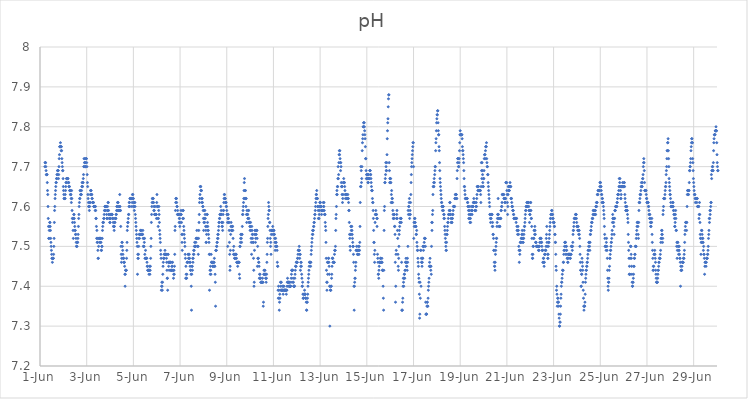
| Category | pH |
|---|---|
| 44348.208333333336 | 7.7 |
| 44348.21875 | 7.71 |
| 44348.229166666664 | 7.71 |
| 44348.239583333336 | 7.71 |
| 44348.25 | 7.7 |
| 44348.260416666664 | 7.69 |
| 44348.270833333336 | 7.68 |
| 44348.28125 | 7.68 |
| 44348.291666666664 | 7.68 |
| 44348.302083333336 | 7.68 |
| 44348.3125 | 7.66 |
| 44348.322916666664 | 7.64 |
| 44348.333333333336 | 7.63 |
| 44348.34375 | 7.6 |
| 44348.354166666664 | 7.57 |
| 44348.364583333336 | 7.55 |
| 44348.375 | 7.52 |
| 44348.385416666664 | 7.52 |
| 44348.395833333336 | 7.54 |
| 44348.40625 | 7.55 |
| 44348.416666666664 | 7.56 |
| 44348.427083333336 | 7.56 |
| 44348.4375 | 7.55 |
| 44348.447916666664 | 7.54 |
| 44348.458333333336 | 7.52 |
| 44348.46875 | 7.51 |
| 44348.479166666664 | 7.5 |
| 44348.489583333336 | 7.49 |
| 44348.5 | 7.48 |
| 44348.510416666664 | 7.47 |
| 44348.520833333336 | 7.47 |
| 44348.53125 | 7.46 |
| 44348.541666666664 | 7.47 |
| 44348.552083333336 | 7.47 |
| 44348.5625 | 7.47 |
| 44348.572916666664 | 7.47 |
| 44348.583333333336 | 7.48 |
| 44348.59375 | 7.5 |
| 44348.604166666664 | 7.52 |
| 44348.614583333336 | 7.56 |
| 44348.625 | 7.59 |
| 44348.635416666664 | 7.6 |
| 44348.645833333336 | 7.62 |
| 44348.65625 | 7.63 |
| 44348.666666666664 | 7.64 |
| 44348.677083333336 | 7.65 |
| 44348.6875 | 7.66 |
| 44348.697916666664 | 7.66 |
| 44348.708333333336 | 7.67 |
| 44348.71875 | 7.67 |
| 44348.729166666664 | 7.68 |
| 44348.739583333336 | 7.68 |
| 44348.75 | 7.69 |
| 44348.760416666664 | 7.69 |
| 44348.770833333336 | 7.69 |
| 44348.78125 | 7.69 |
| 44348.791666666664 | 7.67 |
| 44348.802083333336 | 7.68 |
| 44348.8125 | 7.7 |
| 44348.822916666664 | 7.72 |
| 44348.833333333336 | 7.73 |
| 44348.84375 | 7.75 |
| 44348.854166666664 | 7.75 |
| 44348.864583333336 | 7.75 |
| 44348.875 | 7.76 |
| 44348.885416666664 | 7.75 |
| 44348.895833333336 | 7.75 |
| 44348.90625 | 7.74 |
| 44348.916666666664 | 7.75 |
| 44348.927083333336 | 7.74 |
| 44348.9375 | 7.72 |
| 44348.947916666664 | 7.71 |
| 44348.958333333336 | 7.7 |
| 44348.96875 | 7.69 |
| 44348.979166666664 | 7.69 |
| 44348.989583333336 | 7.67 |
| 44349.0 | 7.65 |
| 44349.010416666664 | 7.64 |
| 44349.020833333336 | 7.63 |
| 44349.03125 | 7.62 |
| 44349.041666666664 | 7.62 |
| 44349.052083333336 | 7.62 |
| 44349.0625 | 7.62 |
| 44349.072916666664 | 7.62 |
| 44349.083333333336 | 7.63 |
| 44349.09375 | 7.64 |
| 44349.104166666664 | 7.65 |
| 44349.114583333336 | 7.66 |
| 44349.125 | 7.66 |
| 44349.135416666664 | 7.67 |
| 44349.145833333336 | 7.67 |
| 44349.15625 | 7.67 |
| 44349.166666666664 | 7.67 |
| 44349.177083333336 | 7.67 |
| 44349.1875 | 7.67 |
| 44349.197916666664 | 7.67 |
| 44349.208333333336 | 7.66 |
| 44349.21875 | 7.66 |
| 44349.229166666664 | 7.66 |
| 44349.239583333336 | 7.65 |
| 44349.25 | 7.65 |
| 44349.260416666664 | 7.65 |
| 44349.270833333336 | 7.64 |
| 44349.28125 | 7.64 |
| 44349.291666666664 | 7.64 |
| 44349.302083333336 | 7.63 |
| 44349.3125 | 7.63 |
| 44349.322916666664 | 7.63 |
| 44349.333333333336 | 7.62 |
| 44349.34375 | 7.61 |
| 44349.354166666664 | 7.64 |
| 44349.364583333336 | 7.62 |
| 44349.375 | 7.59 |
| 44349.385416666664 | 7.57 |
| 44349.395833333336 | 7.56 |
| 44349.40625 | 7.57 |
| 44349.416666666664 | 7.54 |
| 44349.427083333336 | 7.52 |
| 44349.4375 | 7.57 |
| 44349.447916666664 | 7.58 |
| 44349.458333333336 | 7.58 |
| 44349.46875 | 7.57 |
| 44349.479166666664 | 7.56 |
| 44349.489583333336 | 7.55 |
| 44349.5 | 7.54 |
| 44349.510416666664 | 7.54 |
| 44349.520833333336 | 7.53 |
| 44349.53125 | 7.53 |
| 44349.541666666664 | 7.52 |
| 44349.552083333336 | 7.51 |
| 44349.5625 | 7.5 |
| 44349.572916666664 | 7.5 |
| 44349.583333333336 | 7.5 |
| 44349.59375 | 7.51 |
| 44349.604166666664 | 7.51 |
| 44349.614583333336 | 7.51 |
| 44349.625 | 7.52 |
| 44349.635416666664 | 7.53 |
| 44349.645833333336 | 7.55 |
| 44349.65625 | 7.57 |
| 44349.666666666664 | 7.58 |
| 44349.677083333336 | 7.6 |
| 44349.6875 | 7.61 |
| 44349.697916666664 | 7.62 |
| 44349.708333333336 | 7.62 |
| 44349.71875 | 7.64 |
| 44349.729166666664 | 7.64 |
| 44349.739583333336 | 7.63 |
| 44349.75 | 7.63 |
| 44349.760416666664 | 7.63 |
| 44349.770833333336 | 7.63 |
| 44349.78125 | 7.64 |
| 44349.791666666664 | 7.65 |
| 44349.802083333336 | 7.66 |
| 44349.8125 | 7.65 |
| 44349.822916666664 | 7.65 |
| 44349.833333333336 | 7.66 |
| 44349.84375 | 7.66 |
| 44349.854166666664 | 7.67 |
| 44349.864583333336 | 7.68 |
| 44349.875 | 7.7 |
| 44349.885416666664 | 7.72 |
| 44349.895833333336 | 7.7 |
| 44349.90625 | 7.71 |
| 44349.916666666664 | 7.72 |
| 44349.927083333336 | 7.71 |
| 44349.9375 | 7.71 |
| 44349.947916666664 | 7.7 |
| 44349.958333333336 | 7.7 |
| 44349.96875 | 7.72 |
| 44349.979166666664 | 7.72 |
| 44349.989583333336 | 7.72 |
| 44350.0 | 7.71 |
| 44350.010416666664 | 7.7 |
| 44350.020833333336 | 7.68 |
| 44350.03125 | 7.66 |
| 44350.041666666664 | 7.65 |
| 44350.052083333336 | 7.63 |
| 44350.0625 | 7.62 |
| 44350.072916666664 | 7.61 |
| 44350.083333333336 | 7.6 |
| 44350.09375 | 7.6 |
| 44350.104166666664 | 7.6 |
| 44350.114583333336 | 7.59 |
| 44350.125 | 7.6 |
| 44350.135416666664 | 7.61 |
| 44350.145833333336 | 7.61 |
| 44350.15625 | 7.63 |
| 44350.166666666664 | 7.64 |
| 44350.177083333336 | 7.64 |
| 44350.1875 | 7.64 |
| 44350.197916666664 | 7.63 |
| 44350.208333333336 | 7.63 |
| 44350.21875 | 7.63 |
| 44350.229166666664 | 7.62 |
| 44350.239583333336 | 7.62 |
| 44350.25 | 7.61 |
| 44350.260416666664 | 7.61 |
| 44350.270833333336 | 7.61 |
| 44350.28125 | 7.61 |
| 44350.291666666664 | 7.61 |
| 44350.302083333336 | 7.6 |
| 44350.3125 | 7.6 |
| 44350.322916666664 | 7.6 |
| 44350.333333333336 | 7.6 |
| 44350.34375 | 7.6 |
| 44350.354166666664 | 7.6 |
| 44350.364583333336 | 7.59 |
| 44350.375 | 7.6 |
| 44350.385416666664 | 7.59 |
| 44350.395833333336 | 7.57 |
| 44350.40625 | 7.57 |
| 44350.416666666664 | 7.55 |
| 44350.427083333336 | 7.52 |
| 44350.4375 | 7.54 |
| 44350.447916666664 | 7.51 |
| 44350.458333333336 | 7.52 |
| 44350.46875 | 7.51 |
| 44350.479166666664 | 7.49 |
| 44350.489583333336 | 7.47 |
| 44350.5 | 7.47 |
| 44350.510416666664 | 7.5 |
| 44350.520833333336 | 7.52 |
| 44350.53125 | 7.52 |
| 44350.541666666664 | 7.52 |
| 44350.552083333336 | 7.52 |
| 44350.5625 | 7.51 |
| 44350.572916666664 | 7.52 |
| 44350.583333333336 | 7.51 |
| 44350.59375 | 7.52 |
| 44350.604166666664 | 7.52 |
| 44350.614583333336 | 7.51 |
| 44350.625 | 7.49 |
| 44350.635416666664 | 7.49 |
| 44350.645833333336 | 7.5 |
| 44350.65625 | 7.5 |
| 44350.666666666664 | 7.52 |
| 44350.677083333336 | 7.54 |
| 44350.6875 | 7.55 |
| 44350.697916666664 | 7.56 |
| 44350.708333333336 | 7.56 |
| 44350.71875 | 7.56 |
| 44350.729166666664 | 7.57 |
| 44350.739583333336 | 7.57 |
| 44350.75 | 7.58 |
| 44350.760416666664 | 7.59 |
| 44350.770833333336 | 7.59 |
| 44350.78125 | 7.6 |
| 44350.791666666664 | 7.6 |
| 44350.802083333336 | 7.6 |
| 44350.8125 | 7.59 |
| 44350.822916666664 | 7.6 |
| 44350.833333333336 | 7.6 |
| 44350.84375 | 7.6 |
| 44350.854166666664 | 7.58 |
| 44350.864583333336 | 7.57 |
| 44350.875 | 7.57 |
| 44350.885416666664 | 7.59 |
| 44350.895833333336 | 7.6 |
| 44350.90625 | 7.59 |
| 44350.916666666664 | 7.61 |
| 44350.927083333336 | 7.61 |
| 44350.9375 | 7.59 |
| 44350.947916666664 | 7.58 |
| 44350.958333333336 | 7.58 |
| 44350.96875 | 7.57 |
| 44350.979166666664 | 7.57 |
| 44350.989583333336 | 7.56 |
| 44351.0 | 7.56 |
| 44351.010416666664 | 7.57 |
| 44351.020833333336 | 7.57 |
| 44351.03125 | 7.58 |
| 44351.041666666664 | 7.58 |
| 44351.052083333336 | 7.58 |
| 44351.0625 | 7.58 |
| 44351.072916666664 | 7.58 |
| 44351.083333333336 | 7.58 |
| 44351.09375 | 7.58 |
| 44351.104166666664 | 7.57 |
| 44351.114583333336 | 7.57 |
| 44351.125 | 7.57 |
| 44351.135416666664 | 7.56 |
| 44351.145833333336 | 7.55 |
| 44351.15625 | 7.55 |
| 44351.166666666664 | 7.55 |
| 44351.177083333336 | 7.54 |
| 44351.1875 | 7.55 |
| 44351.197916666664 | 7.56 |
| 44351.208333333336 | 7.56 |
| 44351.21875 | 7.57 |
| 44351.229166666664 | 7.57 |
| 44351.239583333336 | 7.57 |
| 44351.25 | 7.57 |
| 44351.260416666664 | 7.58 |
| 44351.270833333336 | 7.58 |
| 44351.28125 | 7.59 |
| 44351.291666666664 | 7.6 |
| 44351.302083333336 | 7.6 |
| 44351.3125 | 7.59 |
| 44351.322916666664 | 7.61 |
| 44351.333333333336 | 7.61 |
| 44351.34375 | 7.61 |
| 44351.354166666664 | 7.59 |
| 44351.364583333336 | 7.6 |
| 44351.375 | 7.59 |
| 44351.385416666664 | 7.59 |
| 44351.395833333336 | 7.59 |
| 44351.40625 | 7.6 |
| 44351.416666666664 | 7.63 |
| 44351.427083333336 | 7.6 |
| 44351.4375 | 7.59 |
| 44351.447916666664 | 7.59 |
| 44351.458333333336 | 7.55 |
| 44351.46875 | 7.5 |
| 44351.479166666664 | 7.48 |
| 44351.489583333336 | 7.46 |
| 44351.5 | 7.47 |
| 44351.510416666664 | 7.51 |
| 44351.520833333336 | 7.51 |
| 44351.53125 | 7.5 |
| 44351.541666666664 | 7.49 |
| 44351.552083333336 | 7.48 |
| 44351.5625 | 7.47 |
| 44351.572916666664 | 7.47 |
| 44351.583333333336 | 7.47 |
| 44351.59375 | 7.46 |
| 44351.604166666664 | 7.46 |
| 44351.614583333336 | 7.46 |
| 44351.625 | 7.45 |
| 44351.635416666664 | 7.43 |
| 44351.645833333336 | 7.4 |
| 44351.65625 | 7.43 |
| 44351.666666666664 | 7.44 |
| 44351.677083333336 | 7.44 |
| 44351.6875 | 7.44 |
| 44351.697916666664 | 7.44 |
| 44351.708333333336 | 7.47 |
| 44351.71875 | 7.49 |
| 44351.729166666664 | 7.51 |
| 44351.739583333336 | 7.54 |
| 44351.75 | 7.55 |
| 44351.760416666664 | 7.56 |
| 44351.770833333336 | 7.56 |
| 44351.78125 | 7.57 |
| 44351.791666666664 | 7.58 |
| 44351.802083333336 | 7.58 |
| 44351.8125 | 7.6 |
| 44351.822916666664 | 7.61 |
| 44351.833333333336 | 7.61 |
| 44351.84375 | 7.6 |
| 44351.854166666664 | 7.62 |
| 44351.864583333336 | 7.62 |
| 44351.875 | 7.62 |
| 44351.885416666664 | 7.62 |
| 44351.895833333336 | 7.62 |
| 44351.90625 | 7.62 |
| 44351.916666666664 | 7.62 |
| 44351.927083333336 | 7.62 |
| 44351.9375 | 7.6 |
| 44351.947916666664 | 7.61 |
| 44351.958333333336 | 7.63 |
| 44351.96875 | 7.62 |
| 44351.979166666664 | 7.63 |
| 44351.989583333336 | 7.62 |
| 44352.0 | 7.62 |
| 44352.010416666664 | 7.61 |
| 44352.020833333336 | 7.6 |
| 44352.03125 | 7.6 |
| 44352.041666666664 | 7.59 |
| 44352.052083333336 | 7.61 |
| 44352.0625 | 7.61 |
| 44352.072916666664 | 7.6 |
| 44352.083333333336 | 7.58 |
| 44352.09375 | 7.57 |
| 44352.104166666664 | 7.56 |
| 44352.114583333336 | 7.55 |
| 44352.125 | 7.54 |
| 44352.135416666664 | 7.53 |
| 44352.145833333336 | 7.52 |
| 44352.15625 | 7.51 |
| 44352.166666666664 | 7.5 |
| 44352.177083333336 | 7.43 |
| 44352.1875 | 7.48 |
| 44352.197916666664 | 7.47 |
| 44352.208333333336 | 7.47 |
| 44352.21875 | 7.48 |
| 44352.229166666664 | 7.5 |
| 44352.239583333336 | 7.52 |
| 44352.25 | 7.53 |
| 44352.260416666664 | 7.52 |
| 44352.270833333336 | 7.53 |
| 44352.28125 | 7.53 |
| 44352.291666666664 | 7.53 |
| 44352.302083333336 | 7.54 |
| 44352.3125 | 7.54 |
| 44352.322916666664 | 7.53 |
| 44352.333333333336 | 7.54 |
| 44352.34375 | 7.53 |
| 44352.354166666664 | 7.53 |
| 44352.364583333336 | 7.53 |
| 44352.375 | 7.53 |
| 44352.385416666664 | 7.53 |
| 44352.395833333336 | 7.53 |
| 44352.40625 | 7.54 |
| 44352.416666666664 | 7.52 |
| 44352.427083333336 | 7.5 |
| 44352.4375 | 7.5 |
| 44352.447916666664 | 7.52 |
| 44352.458333333336 | 7.5 |
| 44352.46875 | 7.51 |
| 44352.479166666664 | 7.52 |
| 44352.489583333336 | 7.48 |
| 44352.5 | 7.47 |
| 44352.510416666664 | 7.47 |
| 44352.520833333336 | 7.49 |
| 44352.53125 | 7.47 |
| 44352.541666666664 | 7.47 |
| 44352.552083333336 | 7.47 |
| 44352.5625 | 7.47 |
| 44352.572916666664 | 7.47 |
| 44352.583333333336 | 7.46 |
| 44352.59375 | 7.45 |
| 44352.604166666664 | 7.45 |
| 44352.614583333336 | 7.44 |
| 44352.625 | 7.44 |
| 44352.635416666664 | 7.44 |
| 44352.645833333336 | 7.44 |
| 44352.65625 | 7.44 |
| 44352.666666666664 | 7.43 |
| 44352.677083333336 | 7.44 |
| 44352.6875 | 7.45 |
| 44352.697916666664 | 7.44 |
| 44352.708333333336 | 7.43 |
| 44352.71875 | 7.44 |
| 44352.729166666664 | 7.45 |
| 44352.739583333336 | 7.47 |
| 44352.75 | 7.5 |
| 44352.760416666664 | 7.52 |
| 44352.770833333336 | 7.56 |
| 44352.78125 | 7.58 |
| 44352.791666666664 | 7.6 |
| 44352.802083333336 | 7.61 |
| 44352.8125 | 7.62 |
| 44352.822916666664 | 7.62 |
| 44352.833333333336 | 7.62 |
| 44352.84375 | 7.61 |
| 44352.854166666664 | 7.62 |
| 44352.864583333336 | 7.61 |
| 44352.875 | 7.59 |
| 44352.885416666664 | 7.6 |
| 44352.895833333336 | 7.59 |
| 44352.90625 | 7.58 |
| 44352.916666666664 | 7.58 |
| 44352.927083333336 | 7.6 |
| 44352.9375 | 7.58 |
| 44352.947916666664 | 7.58 |
| 44352.958333333336 | 7.58 |
| 44352.96875 | 7.58 |
| 44352.979166666664 | 7.58 |
| 44352.989583333336 | 7.57 |
| 44353.0 | 7.61 |
| 44353.010416666664 | 7.63 |
| 44353.020833333336 | 7.6 |
| 44353.03125 | 7.6 |
| 44353.041666666664 | 7.6 |
| 44353.052083333336 | 7.57 |
| 44353.0625 | 7.55 |
| 44353.072916666664 | 7.57 |
| 44353.083333333336 | 7.59 |
| 44353.09375 | 7.6 |
| 44353.104166666664 | 7.58 |
| 44353.114583333336 | 7.56 |
| 44353.125 | 7.54 |
| 44353.135416666664 | 7.53 |
| 44353.145833333336 | 7.52 |
| 44353.15625 | 7.51 |
| 44353.166666666664 | 7.49 |
| 44353.177083333336 | 7.48 |
| 44353.1875 | 7.47 |
| 44353.197916666664 | 7.39 |
| 44353.208333333336 | 7.4 |
| 44353.21875 | 7.41 |
| 44353.229166666664 | 7.4 |
| 44353.239583333336 | 7.39 |
| 44353.25 | 7.41 |
| 44353.260416666664 | 7.43 |
| 44353.270833333336 | 7.45 |
| 44353.28125 | 7.46 |
| 44353.291666666664 | 7.47 |
| 44353.302083333336 | 7.47 |
| 44353.3125 | 7.47 |
| 44353.322916666664 | 7.48 |
| 44353.333333333336 | 7.48 |
| 44353.34375 | 7.48 |
| 44353.354166666664 | 7.49 |
| 44353.364583333336 | 7.48 |
| 44353.375 | 7.48 |
| 44353.385416666664 | 7.48 |
| 44353.395833333336 | 7.48 |
| 44353.40625 | 7.48 |
| 44353.416666666664 | 7.47 |
| 44353.427083333336 | 7.46 |
| 44353.4375 | 7.44 |
| 44353.447916666664 | 7.42 |
| 44353.458333333336 | 7.42 |
| 44353.46875 | 7.39 |
| 44353.479166666664 | 7.48 |
| 44353.489583333336 | 7.48 |
| 44353.5 | 7.46 |
| 44353.510416666664 | 7.45 |
| 44353.520833333336 | 7.46 |
| 44353.53125 | 7.44 |
| 44353.541666666664 | 7.46 |
| 44353.552083333336 | 7.46 |
| 44353.5625 | 7.46 |
| 44353.572916666664 | 7.46 |
| 44353.583333333336 | 7.46 |
| 44353.59375 | 7.46 |
| 44353.604166666664 | 7.44 |
| 44353.614583333336 | 7.44 |
| 44353.625 | 7.44 |
| 44353.635416666664 | 7.44 |
| 44353.645833333336 | 7.45 |
| 44353.65625 | 7.46 |
| 44353.666666666664 | 7.45 |
| 44353.677083333336 | 7.46 |
| 44353.6875 | 7.44 |
| 44353.697916666664 | 7.44 |
| 44353.708333333336 | 7.44 |
| 44353.71875 | 7.42 |
| 44353.729166666664 | 7.43 |
| 44353.739583333336 | 7.44 |
| 44353.75 | 7.43 |
| 44353.760416666664 | 7.45 |
| 44353.770833333336 | 7.48 |
| 44353.78125 | 7.54 |
| 44353.791666666664 | 7.55 |
| 44353.802083333336 | 7.59 |
| 44353.8125 | 7.61 |
| 44353.822916666664 | 7.62 |
| 44353.833333333336 | 7.62 |
| 44353.84375 | 7.62 |
| 44353.854166666664 | 7.61 |
| 44353.864583333336 | 7.6 |
| 44353.875 | 7.6 |
| 44353.885416666664 | 7.58 |
| 44353.895833333336 | 7.59 |
| 44353.90625 | 7.58 |
| 44353.916666666664 | 7.58 |
| 44353.927083333336 | 7.58 |
| 44353.9375 | 7.58 |
| 44353.947916666664 | 7.58 |
| 44353.958333333336 | 7.56 |
| 44353.96875 | 7.57 |
| 44353.979166666664 | 7.57 |
| 44353.989583333336 | 7.55 |
| 44354.0 | 7.56 |
| 44354.010416666664 | 7.58 |
| 44354.020833333336 | 7.58 |
| 44354.03125 | 7.58 |
| 44354.041666666664 | 7.59 |
| 44354.052083333336 | 7.58 |
| 44354.0625 | 7.56 |
| 44354.072916666664 | 7.53 |
| 44354.083333333336 | 7.51 |
| 44354.09375 | 7.49 |
| 44354.104166666664 | 7.53 |
| 44354.114583333336 | 7.57 |
| 44354.125 | 7.59 |
| 44354.135416666664 | 7.59 |
| 44354.145833333336 | 7.57 |
| 44354.15625 | 7.55 |
| 44354.166666666664 | 7.54 |
| 44354.177083333336 | 7.53 |
| 44354.1875 | 7.52 |
| 44354.197916666664 | 7.51 |
| 44354.208333333336 | 7.5 |
| 44354.21875 | 7.48 |
| 44354.229166666664 | 7.47 |
| 44354.239583333336 | 7.42 |
| 44354.25 | 7.45 |
| 44354.260416666664 | 7.43 |
| 44354.270833333336 | 7.42 |
| 44354.28125 | 7.42 |
| 44354.291666666664 | 7.43 |
| 44354.302083333336 | 7.46 |
| 44354.3125 | 7.46 |
| 44354.322916666664 | 7.46 |
| 44354.333333333336 | 7.46 |
| 44354.34375 | 7.48 |
| 44354.354166666664 | 7.48 |
| 44354.364583333336 | 7.47 |
| 44354.375 | 7.47 |
| 44354.385416666664 | 7.47 |
| 44354.395833333336 | 7.48 |
| 44354.40625 | 7.47 |
| 44354.416666666664 | 7.46 |
| 44354.427083333336 | 7.45 |
| 44354.4375 | 7.46 |
| 44354.447916666664 | 7.44 |
| 44354.458333333336 | 7.44 |
| 44354.46875 | 7.43 |
| 44354.479166666664 | 7.4 |
| 44354.489583333336 | 7.34 |
| 44354.5 | 7.43 |
| 44354.510416666664 | 7.45 |
| 44354.520833333336 | 7.45 |
| 44354.53125 | 7.44 |
| 44354.541666666664 | 7.47 |
| 44354.552083333336 | 7.46 |
| 44354.5625 | 7.47 |
| 44354.572916666664 | 7.48 |
| 44354.583333333336 | 7.49 |
| 44354.59375 | 7.48 |
| 44354.604166666664 | 7.49 |
| 44354.614583333336 | 7.5 |
| 44354.625 | 7.51 |
| 44354.635416666664 | 7.5 |
| 44354.645833333336 | 7.5 |
| 44354.65625 | 7.5 |
| 44354.666666666664 | 7.5 |
| 44354.677083333336 | 7.51 |
| 44354.6875 | 7.52 |
| 44354.697916666664 | 7.52 |
| 44354.708333333336 | 7.52 |
| 44354.71875 | 7.54 |
| 44354.729166666664 | 7.52 |
| 44354.739583333336 | 7.52 |
| 44354.75 | 7.5 |
| 44354.760416666664 | 7.5 |
| 44354.770833333336 | 7.5 |
| 44354.78125 | 7.48 |
| 44354.791666666664 | 7.52 |
| 44354.802083333336 | 7.54 |
| 44354.8125 | 7.56 |
| 44354.822916666664 | 7.58 |
| 44354.833333333336 | 7.61 |
| 44354.84375 | 7.62 |
| 44354.854166666664 | 7.63 |
| 44354.864583333336 | 7.65 |
| 44354.875 | 7.65 |
| 44354.885416666664 | 7.65 |
| 44354.895833333336 | 7.64 |
| 44354.90625 | 7.64 |
| 44354.916666666664 | 7.64 |
| 44354.927083333336 | 7.62 |
| 44354.9375 | 7.61 |
| 44354.947916666664 | 7.62 |
| 44354.958333333336 | 7.61 |
| 44354.96875 | 7.6 |
| 44354.979166666664 | 7.6 |
| 44354.989583333336 | 7.59 |
| 44355.0 | 7.57 |
| 44355.010416666664 | 7.54 |
| 44355.020833333336 | 7.56 |
| 44355.03125 | 7.59 |
| 44355.041666666664 | 7.57 |
| 44355.052083333336 | 7.56 |
| 44355.0625 | 7.59 |
| 44355.072916666664 | 7.58 |
| 44355.083333333336 | 7.57 |
| 44355.09375 | 7.55 |
| 44355.104166666664 | 7.54 |
| 44355.114583333336 | 7.51 |
| 44355.125 | 7.51 |
| 44355.135416666664 | 7.53 |
| 44355.145833333336 | 7.55 |
| 44355.15625 | 7.58 |
| 44355.166666666664 | 7.58 |
| 44355.177083333336 | 7.56 |
| 44355.1875 | 7.55 |
| 44355.197916666664 | 7.54 |
| 44355.208333333336 | 7.54 |
| 44355.21875 | 7.53 |
| 44355.229166666664 | 7.52 |
| 44355.239583333336 | 7.51 |
| 44355.25 | 7.48 |
| 44355.260416666664 | 7.39 |
| 44355.270833333336 | 7.48 |
| 44355.28125 | 7.44 |
| 44355.291666666664 | 7.43 |
| 44355.302083333336 | 7.45 |
| 44355.3125 | 7.44 |
| 44355.322916666664 | 7.43 |
| 44355.333333333336 | 7.48 |
| 44355.34375 | 7.46 |
| 44355.354166666664 | 7.46 |
| 44355.364583333336 | 7.46 |
| 44355.375 | 7.46 |
| 44355.385416666664 | 7.46 |
| 44355.395833333336 | 7.45 |
| 44355.40625 | 7.45 |
| 44355.416666666664 | 7.46 |
| 44355.427083333336 | 7.46 |
| 44355.4375 | 7.45 |
| 44355.447916666664 | 7.46 |
| 44355.458333333336 | 7.46 |
| 44355.46875 | 7.47 |
| 44355.479166666664 | 7.45 |
| 44355.489583333336 | 7.45 |
| 44355.5 | 7.43 |
| 44355.510416666664 | 7.41 |
| 44355.520833333336 | 7.35 |
| 44355.53125 | 7.49 |
| 44355.541666666664 | 7.49 |
| 44355.552083333336 | 7.49 |
| 44355.5625 | 7.5 |
| 44355.572916666664 | 7.5 |
| 44355.583333333336 | 7.51 |
| 44355.59375 | 7.51 |
| 44355.604166666664 | 7.52 |
| 44355.614583333336 | 7.53 |
| 44355.625 | 7.52 |
| 44355.635416666664 | 7.53 |
| 44355.645833333336 | 7.54 |
| 44355.65625 | 7.55 |
| 44355.666666666664 | 7.56 |
| 44355.677083333336 | 7.56 |
| 44355.6875 | 7.57 |
| 44355.697916666664 | 7.57 |
| 44355.708333333336 | 7.58 |
| 44355.71875 | 7.58 |
| 44355.729166666664 | 7.58 |
| 44355.739583333336 | 7.6 |
| 44355.75 | 7.58 |
| 44355.760416666664 | 7.59 |
| 44355.770833333336 | 7.58 |
| 44355.78125 | 7.56 |
| 44355.791666666664 | 7.56 |
| 44355.802083333336 | 7.55 |
| 44355.8125 | 7.55 |
| 44355.822916666664 | 7.54 |
| 44355.833333333336 | 7.56 |
| 44355.84375 | 7.58 |
| 44355.854166666664 | 7.59 |
| 44355.864583333336 | 7.59 |
| 44355.875 | 7.61 |
| 44355.885416666664 | 7.62 |
| 44355.895833333336 | 7.63 |
| 44355.90625 | 7.63 |
| 44355.916666666664 | 7.62 |
| 44355.927083333336 | 7.62 |
| 44355.9375 | 7.62 |
| 44355.947916666664 | 7.61 |
| 44355.958333333336 | 7.61 |
| 44355.96875 | 7.61 |
| 44355.979166666664 | 7.6 |
| 44355.989583333336 | 7.6 |
| 44356.0 | 7.59 |
| 44356.010416666664 | 7.58 |
| 44356.020833333336 | 7.58 |
| 44356.03125 | 7.56 |
| 44356.041666666664 | 7.5 |
| 44356.052083333336 | 7.57 |
| 44356.0625 | 7.58 |
| 44356.072916666664 | 7.57 |
| 44356.083333333336 | 7.56 |
| 44356.09375 | 7.56 |
| 44356.104166666664 | 7.54 |
| 44356.114583333336 | 7.51 |
| 44356.125 | 7.48 |
| 44356.135416666664 | 7.44 |
| 44356.145833333336 | 7.45 |
| 44356.15625 | 7.49 |
| 44356.166666666664 | 7.53 |
| 44356.177083333336 | 7.55 |
| 44356.1875 | 7.56 |
| 44356.197916666664 | 7.54 |
| 44356.208333333336 | 7.54 |
| 44356.21875 | 7.54 |
| 44356.229166666664 | 7.55 |
| 44356.239583333336 | 7.55 |
| 44356.25 | 7.55 |
| 44356.260416666664 | 7.54 |
| 44356.270833333336 | 7.52 |
| 44356.28125 | 7.49 |
| 44356.291666666664 | 7.48 |
| 44356.302083333336 | 7.5 |
| 44356.3125 | 7.48 |
| 44356.322916666664 | 7.48 |
| 44356.333333333336 | 7.47 |
| 44356.34375 | 7.47 |
| 44356.354166666664 | 7.47 |
| 44356.364583333336 | 7.48 |
| 44356.375 | 7.48 |
| 44356.385416666664 | 7.47 |
| 44356.395833333336 | 7.48 |
| 44356.40625 | 7.48 |
| 44356.416666666664 | 7.47 |
| 44356.427083333336 | 7.46 |
| 44356.4375 | 7.46 |
| 44356.447916666664 | 7.46 |
| 44356.458333333336 | 7.46 |
| 44356.46875 | 7.45 |
| 44356.479166666664 | 7.46 |
| 44356.489583333336 | 7.46 |
| 44356.5 | 7.46 |
| 44356.510416666664 | 7.46 |
| 44356.520833333336 | 7.46 |
| 44356.53125 | 7.46 |
| 44356.541666666664 | 7.43 |
| 44356.552083333336 | 7.42 |
| 44356.5625 | 7.5 |
| 44356.572916666664 | 7.5 |
| 44356.583333333336 | 7.51 |
| 44356.59375 | 7.52 |
| 44356.604166666664 | 7.53 |
| 44356.614583333336 | 7.53 |
| 44356.625 | 7.52 |
| 44356.635416666664 | 7.51 |
| 44356.645833333336 | 7.53 |
| 44356.65625 | 7.53 |
| 44356.666666666664 | 7.55 |
| 44356.677083333336 | 7.58 |
| 44356.6875 | 7.58 |
| 44356.697916666664 | 7.59 |
| 44356.708333333336 | 7.6 |
| 44356.71875 | 7.61 |
| 44356.729166666664 | 7.62 |
| 44356.739583333336 | 7.64 |
| 44356.75 | 7.66 |
| 44356.760416666664 | 7.67 |
| 44356.770833333336 | 7.62 |
| 44356.78125 | 7.64 |
| 44356.791666666664 | 7.62 |
| 44356.802083333336 | 7.64 |
| 44356.8125 | 7.62 |
| 44356.822916666664 | 7.6 |
| 44356.833333333336 | 7.62 |
| 44356.84375 | 7.58 |
| 44356.854166666664 | 7.56 |
| 44356.864583333336 | 7.59 |
| 44356.875 | 7.58 |
| 44356.885416666664 | 7.58 |
| 44356.895833333336 | 7.58 |
| 44356.90625 | 7.57 |
| 44356.916666666664 | 7.57 |
| 44356.927083333336 | 7.59 |
| 44356.9375 | 7.59 |
| 44356.947916666664 | 7.57 |
| 44356.958333333336 | 7.56 |
| 44356.96875 | 7.56 |
| 44356.979166666664 | 7.56 |
| 44356.989583333336 | 7.55 |
| 44357.0 | 7.54 |
| 44357.010416666664 | 7.55 |
| 44357.020833333336 | 7.56 |
| 44357.03125 | 7.54 |
| 44357.041666666664 | 7.52 |
| 44357.052083333336 | 7.51 |
| 44357.0625 | 7.48 |
| 44357.072916666664 | 7.55 |
| 44357.083333333336 | 7.54 |
| 44357.09375 | 7.53 |
| 44357.104166666664 | 7.52 |
| 44357.114583333336 | 7.53 |
| 44357.125 | 7.51 |
| 44357.135416666664 | 7.51 |
| 44357.145833333336 | 7.47 |
| 44357.15625 | 7.44 |
| 44357.166666666664 | 7.4 |
| 44357.177083333336 | 7.41 |
| 44357.1875 | 7.49 |
| 44357.197916666664 | 7.53 |
| 44357.208333333336 | 7.54 |
| 44357.21875 | 7.54 |
| 44357.229166666664 | 7.51 |
| 44357.239583333336 | 7.52 |
| 44357.25 | 7.53 |
| 44357.260416666664 | 7.53 |
| 44357.270833333336 | 7.54 |
| 44357.28125 | 7.54 |
| 44357.291666666664 | 7.54 |
| 44357.302083333336 | 7.52 |
| 44357.3125 | 7.45 |
| 44357.322916666664 | 7.5 |
| 44357.333333333336 | 7.47 |
| 44357.34375 | 7.47 |
| 44357.354166666664 | 7.47 |
| 44357.364583333336 | 7.46 |
| 44357.375 | 7.46 |
| 44357.385416666664 | 7.45 |
| 44357.395833333336 | 7.42 |
| 44357.40625 | 7.43 |
| 44357.416666666664 | 7.42 |
| 44357.427083333336 | 7.43 |
| 44357.4375 | 7.42 |
| 44357.447916666664 | 7.42 |
| 44357.458333333336 | 7.41 |
| 44357.46875 | 7.41 |
| 44357.479166666664 | 7.41 |
| 44357.489583333336 | 7.41 |
| 44357.5 | 7.41 |
| 44357.510416666664 | 7.41 |
| 44357.520833333336 | 7.41 |
| 44357.53125 | 7.42 |
| 44357.541666666664 | 7.41 |
| 44357.552083333336 | 7.41 |
| 44357.5625 | 7.35 |
| 44357.572916666664 | 7.36 |
| 44357.583333333336 | 7.43 |
| 44357.59375 | 7.44 |
| 44357.604166666664 | 7.43 |
| 44357.614583333336 | 7.43 |
| 44357.625 | 7.44 |
| 44357.635416666664 | 7.44 |
| 44357.645833333336 | 7.43 |
| 44357.65625 | 7.43 |
| 44357.666666666664 | 7.42 |
| 44357.677083333336 | 7.42 |
| 44357.6875 | 7.41 |
| 44357.697916666664 | 7.42 |
| 44357.708333333336 | 7.43 |
| 44357.71875 | 7.46 |
| 44357.729166666664 | 7.48 |
| 44357.739583333336 | 7.51 |
| 44357.75 | 7.52 |
| 44357.760416666664 | 7.55 |
| 44357.770833333336 | 7.57 |
| 44357.78125 | 7.58 |
| 44357.791666666664 | 7.61 |
| 44357.802083333336 | 7.6 |
| 44357.8125 | 7.59 |
| 44357.822916666664 | 7.59 |
| 44357.833333333336 | 7.56 |
| 44357.84375 | 7.56 |
| 44357.854166666664 | 7.54 |
| 44357.864583333336 | 7.52 |
| 44357.875 | 7.5 |
| 44357.885416666664 | 7.51 |
| 44357.895833333336 | 7.48 |
| 44357.90625 | 7.53 |
| 44357.916666666664 | 7.54 |
| 44357.927083333336 | 7.54 |
| 44357.9375 | 7.54 |
| 44357.947916666664 | 7.54 |
| 44357.958333333336 | 7.54 |
| 44357.96875 | 7.55 |
| 44357.979166666664 | 7.53 |
| 44357.989583333336 | 7.54 |
| 44358.0 | 7.54 |
| 44358.010416666664 | 7.54 |
| 44358.020833333336 | 7.54 |
| 44358.03125 | 7.53 |
| 44358.041666666664 | 7.53 |
| 44358.052083333336 | 7.52 |
| 44358.0625 | 7.51 |
| 44358.072916666664 | 7.49 |
| 44358.083333333336 | 7.5 |
| 44358.09375 | 7.52 |
| 44358.104166666664 | 7.51 |
| 44358.114583333336 | 7.51 |
| 44358.125 | 7.5 |
| 44358.135416666664 | 7.5 |
| 44358.145833333336 | 7.5 |
| 44358.15625 | 7.49 |
| 44358.166666666664 | 7.46 |
| 44358.177083333336 | 7.45 |
| 44358.1875 | 7.45 |
| 44358.197916666664 | 7.39 |
| 44358.208333333336 | 7.37 |
| 44358.21875 | 7.4 |
| 44358.229166666664 | 7.39 |
| 44358.239583333336 | 7.37 |
| 44358.25 | 7.34 |
| 44358.260416666664 | 7.36 |
| 44358.270833333336 | 7.38 |
| 44358.28125 | 7.37 |
| 44358.291666666664 | 7.39 |
| 44358.302083333336 | 7.41 |
| 44358.3125 | 7.4 |
| 44358.322916666664 | 7.41 |
| 44358.333333333336 | 7.41 |
| 44358.34375 | 7.39 |
| 44358.354166666664 | 7.39 |
| 44358.364583333336 | 7.39 |
| 44358.375 | 7.39 |
| 44358.385416666664 | 7.4 |
| 44358.395833333336 | 7.39 |
| 44358.40625 | 7.39 |
| 44358.416666666664 | 7.38 |
| 44358.427083333336 | 7.39 |
| 44358.4375 | 7.4 |
| 44358.447916666664 | 7.4 |
| 44358.458333333336 | 7.39 |
| 44358.46875 | 7.39 |
| 44358.479166666664 | 7.39 |
| 44358.489583333336 | 7.39 |
| 44358.5 | 7.39 |
| 44358.510416666664 | 7.39 |
| 44358.520833333336 | 7.39 |
| 44358.53125 | 7.39 |
| 44358.541666666664 | 7.39 |
| 44358.552083333336 | 7.38 |
| 44358.5625 | 7.39 |
| 44358.572916666664 | 7.39 |
| 44358.583333333336 | 7.4 |
| 44358.59375 | 7.41 |
| 44358.604166666664 | 7.42 |
| 44358.614583333336 | 7.41 |
| 44358.625 | 7.41 |
| 44358.635416666664 | 7.4 |
| 44358.645833333336 | 7.41 |
| 44358.65625 | 7.41 |
| 44358.666666666664 | 7.41 |
| 44358.677083333336 | 7.41 |
| 44358.6875 | 7.4 |
| 44358.697916666664 | 7.4 |
| 44358.708333333336 | 7.4 |
| 44358.71875 | 7.4 |
| 44358.729166666664 | 7.4 |
| 44358.739583333336 | 7.4 |
| 44358.75 | 7.41 |
| 44358.760416666664 | 7.42 |
| 44358.770833333336 | 7.43 |
| 44358.78125 | 7.44 |
| 44358.791666666664 | 7.44 |
| 44358.802083333336 | 7.44 |
| 44358.8125 | 7.44 |
| 44358.822916666664 | 7.44 |
| 44358.833333333336 | 7.41 |
| 44358.84375 | 7.42 |
| 44358.854166666664 | 7.41 |
| 44358.864583333336 | 7.4 |
| 44358.875 | 7.4 |
| 44358.885416666664 | 7.4 |
| 44358.895833333336 | 7.4 |
| 44358.90625 | 7.4 |
| 44358.916666666664 | 7.42 |
| 44358.927083333336 | 7.43 |
| 44358.9375 | 7.44 |
| 44358.947916666664 | 7.45 |
| 44358.958333333336 | 7.45 |
| 44358.96875 | 7.45 |
| 44358.979166666664 | 7.46 |
| 44358.989583333336 | 7.46 |
| 44359.0 | 7.46 |
| 44359.010416666664 | 7.46 |
| 44359.020833333336 | 7.46 |
| 44359.03125 | 7.47 |
| 44359.041666666664 | 7.47 |
| 44359.052083333336 | 7.48 |
| 44359.0625 | 7.49 |
| 44359.072916666664 | 7.49 |
| 44359.083333333336 | 7.49 |
| 44359.09375 | 7.49 |
| 44359.104166666664 | 7.5 |
| 44359.114583333336 | 7.49 |
| 44359.125 | 7.47 |
| 44359.135416666664 | 7.48 |
| 44359.145833333336 | 7.48 |
| 44359.15625 | 7.44 |
| 44359.166666666664 | 7.45 |
| 44359.177083333336 | 7.46 |
| 44359.1875 | 7.46 |
| 44359.197916666664 | 7.45 |
| 44359.208333333336 | 7.43 |
| 44359.21875 | 7.42 |
| 44359.229166666664 | 7.4 |
| 44359.239583333336 | 7.4 |
| 44359.25 | 7.41 |
| 44359.260416666664 | 7.38 |
| 44359.270833333336 | 7.37 |
| 44359.28125 | 7.37 |
| 44359.291666666664 | 7.37 |
| 44359.302083333336 | 7.38 |
| 44359.3125 | 7.38 |
| 44359.322916666664 | 7.38 |
| 44359.333333333336 | 7.39 |
| 44359.34375 | 7.38 |
| 44359.354166666664 | 7.38 |
| 44359.364583333336 | 7.38 |
| 44359.375 | 7.37 |
| 44359.385416666664 | 7.37 |
| 44359.395833333336 | 7.37 |
| 44359.40625 | 7.36 |
| 44359.416666666664 | 7.34 |
| 44359.427083333336 | 7.34 |
| 44359.4375 | 7.36 |
| 44359.447916666664 | 7.36 |
| 44359.458333333336 | 7.37 |
| 44359.46875 | 7.38 |
| 44359.479166666664 | 7.4 |
| 44359.489583333336 | 7.41 |
| 44359.5 | 7.42 |
| 44359.510416666664 | 7.43 |
| 44359.520833333336 | 7.44 |
| 44359.53125 | 7.45 |
| 44359.541666666664 | 7.46 |
| 44359.552083333336 | 7.46 |
| 44359.5625 | 7.46 |
| 44359.572916666664 | 7.46 |
| 44359.583333333336 | 7.46 |
| 44359.59375 | 7.45 |
| 44359.604166666664 | 7.46 |
| 44359.614583333336 | 7.48 |
| 44359.625 | 7.49 |
| 44359.635416666664 | 7.5 |
| 44359.645833333336 | 7.51 |
| 44359.65625 | 7.52 |
| 44359.666666666664 | 7.53 |
| 44359.677083333336 | 7.54 |
| 44359.6875 | 7.53 |
| 44359.697916666664 | 7.54 |
| 44359.708333333336 | 7.54 |
| 44359.71875 | 7.55 |
| 44359.729166666664 | 7.55 |
| 44359.739583333336 | 7.56 |
| 44359.75 | 7.56 |
| 44359.760416666664 | 7.57 |
| 44359.770833333336 | 7.58 |
| 44359.78125 | 7.58 |
| 44359.791666666664 | 7.59 |
| 44359.802083333336 | 7.6 |
| 44359.8125 | 7.61 |
| 44359.822916666664 | 7.62 |
| 44359.833333333336 | 7.63 |
| 44359.84375 | 7.63 |
| 44359.854166666664 | 7.64 |
| 44359.864583333336 | 7.62 |
| 44359.875 | 7.62 |
| 44359.885416666664 | 7.62 |
| 44359.895833333336 | 7.6 |
| 44359.90625 | 7.6 |
| 44359.916666666664 | 7.59 |
| 44359.927083333336 | 7.57 |
| 44359.9375 | 7.57 |
| 44359.947916666664 | 7.57 |
| 44359.958333333336 | 7.58 |
| 44359.96875 | 7.59 |
| 44359.979166666664 | 7.6 |
| 44359.989583333336 | 7.61 |
| 44360.0 | 7.61 |
| 44360.010416666664 | 7.61 |
| 44360.020833333336 | 7.6 |
| 44360.03125 | 7.6 |
| 44360.041666666664 | 7.6 |
| 44360.052083333336 | 7.59 |
| 44360.0625 | 7.58 |
| 44360.072916666664 | 7.59 |
| 44360.083333333336 | 7.59 |
| 44360.09375 | 7.59 |
| 44360.104166666664 | 7.59 |
| 44360.114583333336 | 7.59 |
| 44360.125 | 7.59 |
| 44360.135416666664 | 7.61 |
| 44360.145833333336 | 7.6 |
| 44360.15625 | 7.6 |
| 44360.166666666664 | 7.61 |
| 44360.177083333336 | 7.59 |
| 44360.1875 | 7.58 |
| 44360.197916666664 | 7.58 |
| 44360.208333333336 | 7.58 |
| 44360.21875 | 7.56 |
| 44360.229166666664 | 7.55 |
| 44360.239583333336 | 7.54 |
| 44360.25 | 7.51 |
| 44360.260416666664 | 7.47 |
| 44360.270833333336 | 7.44 |
| 44360.28125 | 7.41 |
| 44360.291666666664 | 7.39 |
| 44360.302083333336 | 7.41 |
| 44360.3125 | 7.46 |
| 44360.322916666664 | 7.43 |
| 44360.333333333336 | 7.46 |
| 44360.34375 | 7.46 |
| 44360.354166666664 | 7.47 |
| 44360.364583333336 | 7.47 |
| 44360.375 | 7.46 |
| 44360.385416666664 | 7.45 |
| 44360.395833333336 | 7.43 |
| 44360.40625 | 7.4 |
| 44360.416666666664 | 7.3 |
| 44360.427083333336 | 7.4 |
| 44360.4375 | 7.39 |
| 44360.447916666664 | 7.39 |
| 44360.458333333336 | 7.39 |
| 44360.46875 | 7.4 |
| 44360.479166666664 | 7.4 |
| 44360.489583333336 | 7.42 |
| 44360.5 | 7.43 |
| 44360.510416666664 | 7.45 |
| 44360.520833333336 | 7.47 |
| 44360.53125 | 7.47 |
| 44360.541666666664 | 7.47 |
| 44360.552083333336 | 7.46 |
| 44360.5625 | 7.46 |
| 44360.572916666664 | 7.46 |
| 44360.583333333336 | 7.46 |
| 44360.59375 | 7.46 |
| 44360.604166666664 | 7.46 |
| 44360.614583333336 | 7.48 |
| 44360.625 | 7.49 |
| 44360.635416666664 | 7.49 |
| 44360.645833333336 | 7.49 |
| 44360.65625 | 7.5 |
| 44360.666666666664 | 7.54 |
| 44360.677083333336 | 7.57 |
| 44360.6875 | 7.58 |
| 44360.697916666664 | 7.6 |
| 44360.708333333336 | 7.63 |
| 44360.71875 | 7.64 |
| 44360.729166666664 | 7.63 |
| 44360.739583333336 | 7.65 |
| 44360.75 | 7.65 |
| 44360.760416666664 | 7.67 |
| 44360.770833333336 | 7.7 |
| 44360.78125 | 7.67 |
| 44360.791666666664 | 7.68 |
| 44360.802083333336 | 7.71 |
| 44360.8125 | 7.73 |
| 44360.822916666664 | 7.74 |
| 44360.833333333336 | 7.73 |
| 44360.84375 | 7.74 |
| 44360.854166666664 | 7.72 |
| 44360.864583333336 | 7.71 |
| 44360.875 | 7.69 |
| 44360.885416666664 | 7.71 |
| 44360.895833333336 | 7.7 |
| 44360.90625 | 7.66 |
| 44360.916666666664 | 7.65 |
| 44360.927083333336 | 7.65 |
| 44360.9375 | 7.63 |
| 44360.947916666664 | 7.65 |
| 44360.958333333336 | 7.61 |
| 44360.96875 | 7.62 |
| 44360.979166666664 | 7.63 |
| 44360.989583333336 | 7.66 |
| 44361.0 | 7.66 |
| 44361.010416666664 | 7.67 |
| 44361.020833333336 | 7.66 |
| 44361.03125 | 7.66 |
| 44361.041666666664 | 7.66 |
| 44361.052083333336 | 7.65 |
| 44361.0625 | 7.64 |
| 44361.072916666664 | 7.63 |
| 44361.083333333336 | 7.62 |
| 44361.09375 | 7.63 |
| 44361.104166666664 | 7.63 |
| 44361.114583333336 | 7.63 |
| 44361.125 | 7.63 |
| 44361.135416666664 | 7.63 |
| 44361.145833333336 | 7.62 |
| 44361.15625 | 7.62 |
| 44361.166666666664 | 7.62 |
| 44361.177083333336 | 7.62 |
| 44361.1875 | 7.63 |
| 44361.197916666664 | 7.62 |
| 44361.208333333336 | 7.62 |
| 44361.21875 | 7.61 |
| 44361.229166666664 | 7.59 |
| 44361.239583333336 | 7.59 |
| 44361.25 | 7.56 |
| 44361.260416666664 | 7.53 |
| 44361.270833333336 | 7.52 |
| 44361.28125 | 7.5 |
| 44361.291666666664 | 7.49 |
| 44361.302083333336 | 7.53 |
| 44361.3125 | 7.55 |
| 44361.322916666664 | 7.53 |
| 44361.333333333336 | 7.54 |
| 44361.34375 | 7.55 |
| 44361.354166666664 | 7.55 |
| 44361.364583333336 | 7.54 |
| 44361.375 | 7.53 |
| 44361.385416666664 | 7.52 |
| 44361.395833333336 | 7.51 |
| 44361.40625 | 7.5 |
| 44361.416666666664 | 7.5 |
| 44361.427083333336 | 7.48 |
| 44361.4375 | 7.46 |
| 44361.447916666664 | 7.4 |
| 44361.458333333336 | 7.34 |
| 44361.46875 | 7.4 |
| 44361.479166666664 | 7.41 |
| 44361.489583333336 | 7.42 |
| 44361.5 | 7.42 |
| 44361.510416666664 | 7.44 |
| 44361.520833333336 | 7.45 |
| 44361.53125 | 7.46 |
| 44361.541666666664 | 7.49 |
| 44361.552083333336 | 7.49 |
| 44361.5625 | 7.5 |
| 44361.572916666664 | 7.49 |
| 44361.583333333336 | 7.49 |
| 44361.59375 | 7.48 |
| 44361.604166666664 | 7.49 |
| 44361.614583333336 | 7.48 |
| 44361.625 | 7.48 |
| 44361.635416666664 | 7.5 |
| 44361.645833333336 | 7.49 |
| 44361.65625 | 7.49 |
| 44361.666666666664 | 7.48 |
| 44361.677083333336 | 7.5 |
| 44361.6875 | 7.49 |
| 44361.697916666664 | 7.51 |
| 44361.708333333336 | 7.55 |
| 44361.71875 | 7.61 |
| 44361.729166666664 | 7.65 |
| 44361.739583333336 | 7.7 |
| 44361.75 | 7.65 |
| 44361.760416666664 | 7.69 |
| 44361.770833333336 | 7.66 |
| 44361.78125 | 7.67 |
| 44361.791666666664 | 7.7 |
| 44361.802083333336 | 7.74 |
| 44361.8125 | 7.76 |
| 44361.822916666664 | 7.77 |
| 44361.833333333336 | 7.78 |
| 44361.84375 | 7.8 |
| 44361.854166666664 | 7.8 |
| 44361.864583333336 | 7.81 |
| 44361.875 | 7.81 |
| 44361.885416666664 | 7.81 |
| 44361.895833333336 | 7.8 |
| 44361.90625 | 7.79 |
| 44361.916666666664 | 7.78 |
| 44361.927083333336 | 7.77 |
| 44361.9375 | 7.75 |
| 44361.947916666664 | 7.72 |
| 44361.958333333336 | 7.72 |
| 44361.96875 | 7.69 |
| 44361.979166666664 | 7.67 |
| 44361.989583333336 | 7.68 |
| 44362.0 | 7.68 |
| 44362.010416666664 | 7.67 |
| 44362.020833333336 | 7.67 |
| 44362.03125 | 7.68 |
| 44362.041666666664 | 7.68 |
| 44362.052083333336 | 7.66 |
| 44362.0625 | 7.66 |
| 44362.072916666664 | 7.68 |
| 44362.083333333336 | 7.67 |
| 44362.09375 | 7.67 |
| 44362.104166666664 | 7.67 |
| 44362.114583333336 | 7.67 |
| 44362.125 | 7.69 |
| 44362.135416666664 | 7.69 |
| 44362.145833333336 | 7.69 |
| 44362.15625 | 7.68 |
| 44362.166666666664 | 7.68 |
| 44362.177083333336 | 7.67 |
| 44362.1875 | 7.66 |
| 44362.197916666664 | 7.65 |
| 44362.208333333336 | 7.64 |
| 44362.21875 | 7.64 |
| 44362.229166666664 | 7.64 |
| 44362.239583333336 | 7.62 |
| 44362.25 | 7.61 |
| 44362.260416666664 | 7.61 |
| 44362.270833333336 | 7.59 |
| 44362.28125 | 7.57 |
| 44362.291666666664 | 7.54 |
| 44362.302083333336 | 7.51 |
| 44362.3125 | 7.51 |
| 44362.322916666664 | 7.48 |
| 44362.333333333336 | 7.46 |
| 44362.34375 | 7.49 |
| 44362.354166666664 | 7.56 |
| 44362.364583333336 | 7.58 |
| 44362.375 | 7.58 |
| 44362.385416666664 | 7.59 |
| 44362.395833333336 | 7.58 |
| 44362.40625 | 7.58 |
| 44362.416666666664 | 7.58 |
| 44362.427083333336 | 7.57 |
| 44362.4375 | 7.55 |
| 44362.447916666664 | 7.57 |
| 44362.458333333336 | 7.48 |
| 44362.46875 | 7.47 |
| 44362.479166666664 | 7.46 |
| 44362.489583333336 | 7.43 |
| 44362.5 | 7.43 |
| 44362.510416666664 | 7.42 |
| 44362.520833333336 | 7.44 |
| 44362.53125 | 7.45 |
| 44362.541666666664 | 7.46 |
| 44362.552083333336 | 7.46 |
| 44362.5625 | 7.46 |
| 44362.572916666664 | 7.46 |
| 44362.583333333336 | 7.47 |
| 44362.59375 | 7.47 |
| 44362.604166666664 | 7.46 |
| 44362.614583333336 | 7.46 |
| 44362.625 | 7.46 |
| 44362.635416666664 | 7.46 |
| 44362.645833333336 | 7.47 |
| 44362.65625 | 7.46 |
| 44362.666666666664 | 7.44 |
| 44362.677083333336 | 7.44 |
| 44362.6875 | 7.44 |
| 44362.697916666664 | 7.4 |
| 44362.708333333336 | 7.37 |
| 44362.71875 | 7.34 |
| 44362.729166666664 | 7.44 |
| 44362.739583333336 | 7.54 |
| 44362.75 | 7.59 |
| 44362.760416666664 | 7.6 |
| 44362.770833333336 | 7.66 |
| 44362.78125 | 7.66 |
| 44362.791666666664 | 7.67 |
| 44362.802083333336 | 7.68 |
| 44362.8125 | 7.71 |
| 44362.822916666664 | 7.7 |
| 44362.833333333336 | 7.69 |
| 44362.84375 | 7.69 |
| 44362.854166666664 | 7.71 |
| 44362.864583333336 | 7.73 |
| 44362.875 | 7.77 |
| 44362.885416666664 | 7.79 |
| 44362.895833333336 | 7.81 |
| 44362.90625 | 7.82 |
| 44362.916666666664 | 7.85 |
| 44362.927083333336 | 7.87 |
| 44362.9375 | 7.88 |
| 44362.947916666664 | 7.88 |
| 44362.958333333336 | 7.71 |
| 44362.96875 | 7.69 |
| 44362.979166666664 | 7.66 |
| 44362.989583333336 | 7.67 |
| 44363.0 | 7.67 |
| 44363.010416666664 | 7.66 |
| 44363.020833333336 | 7.67 |
| 44363.03125 | 7.66 |
| 44363.041666666664 | 7.61 |
| 44363.052083333336 | 7.63 |
| 44363.0625 | 7.64 |
| 44363.072916666664 | 7.61 |
| 44363.083333333336 | 7.62 |
| 44363.09375 | 7.62 |
| 44363.104166666664 | 7.61 |
| 44363.114583333336 | 7.59 |
| 44363.125 | 7.58 |
| 44363.135416666664 | 7.57 |
| 44363.145833333336 | 7.57 |
| 44363.15625 | 7.57 |
| 44363.166666666664 | 7.58 |
| 44363.177083333336 | 7.58 |
| 44363.1875 | 7.55 |
| 44363.197916666664 | 7.55 |
| 44363.208333333336 | 7.53 |
| 44363.21875 | 7.46 |
| 44363.229166666664 | 7.36 |
| 44363.239583333336 | 7.4 |
| 44363.25 | 7.48 |
| 44363.260416666664 | 7.49 |
| 44363.270833333336 | 7.57 |
| 44363.28125 | 7.58 |
| 44363.291666666664 | 7.59 |
| 44363.302083333336 | 7.57 |
| 44363.3125 | 7.54 |
| 44363.322916666664 | 7.52 |
| 44363.333333333336 | 7.48 |
| 44363.34375 | 7.45 |
| 44363.354166666664 | 7.44 |
| 44363.364583333336 | 7.47 |
| 44363.375 | 7.5 |
| 44363.385416666664 | 7.53 |
| 44363.395833333336 | 7.54 |
| 44363.40625 | 7.55 |
| 44363.416666666664 | 7.56 |
| 44363.427083333336 | 7.56 |
| 44363.4375 | 7.57 |
| 44363.447916666664 | 7.57 |
| 44363.458333333336 | 7.57 |
| 44363.46875 | 7.57 |
| 44363.479166666664 | 7.56 |
| 44363.489583333336 | 7.46 |
| 44363.5 | 7.34 |
| 44363.510416666664 | 7.34 |
| 44363.520833333336 | 7.34 |
| 44363.53125 | 7.36 |
| 44363.541666666664 | 7.37 |
| 44363.552083333336 | 7.4 |
| 44363.5625 | 7.42 |
| 44363.572916666664 | 7.41 |
| 44363.583333333336 | 7.4 |
| 44363.59375 | 7.42 |
| 44363.604166666664 | 7.43 |
| 44363.614583333336 | 7.43 |
| 44363.625 | 7.42 |
| 44363.635416666664 | 7.44 |
| 44363.645833333336 | 7.44 |
| 44363.65625 | 7.46 |
| 44363.666666666664 | 7.46 |
| 44363.677083333336 | 7.47 |
| 44363.6875 | 7.46 |
| 44363.697916666664 | 7.45 |
| 44363.708333333336 | 7.46 |
| 44363.71875 | 7.45 |
| 44363.729166666664 | 7.44 |
| 44363.739583333336 | 7.47 |
| 44363.75 | 7.46 |
| 44363.760416666664 | 7.5 |
| 44363.770833333336 | 7.59 |
| 44363.78125 | 7.58 |
| 44363.791666666664 | 7.6 |
| 44363.802083333336 | 7.6 |
| 44363.8125 | 7.61 |
| 44363.822916666664 | 7.62 |
| 44363.833333333336 | 7.57 |
| 44363.84375 | 7.58 |
| 44363.854166666664 | 7.59 |
| 44363.864583333336 | 7.58 |
| 44363.875 | 7.61 |
| 44363.885416666664 | 7.63 |
| 44363.895833333336 | 7.66 |
| 44363.90625 | 7.68 |
| 44363.916666666664 | 7.7 |
| 44363.927083333336 | 7.71 |
| 44363.9375 | 7.72 |
| 44363.947916666664 | 7.73 |
| 44363.958333333336 | 7.74 |
| 44363.96875 | 7.75 |
| 44363.979166666664 | 7.76 |
| 44363.989583333336 | 7.76 |
| 44364.0 | 7.7 |
| 44364.010416666664 | 7.52 |
| 44364.020833333336 | 7.56 |
| 44364.03125 | 7.55 |
| 44364.041666666664 | 7.57 |
| 44364.052083333336 | 7.56 |
| 44364.0625 | 7.57 |
| 44364.072916666664 | 7.56 |
| 44364.083333333336 | 7.55 |
| 44364.09375 | 7.55 |
| 44364.104166666664 | 7.55 |
| 44364.114583333336 | 7.53 |
| 44364.125 | 7.53 |
| 44364.135416666664 | 7.54 |
| 44364.145833333336 | 7.51 |
| 44364.15625 | 7.5 |
| 44364.166666666664 | 7.49 |
| 44364.177083333336 | 7.49 |
| 44364.1875 | 7.47 |
| 44364.197916666664 | 7.46 |
| 44364.208333333336 | 7.45 |
| 44364.21875 | 7.43 |
| 44364.229166666664 | 7.42 |
| 44364.239583333336 | 7.41 |
| 44364.25 | 7.38 |
| 44364.260416666664 | 7.32 |
| 44364.270833333336 | 7.33 |
| 44364.28125 | 7.41 |
| 44364.291666666664 | 7.37 |
| 44364.302083333336 | 7.49 |
| 44364.3125 | 7.49 |
| 44364.322916666664 | 7.4 |
| 44364.333333333336 | 7.47 |
| 44364.34375 | 7.46 |
| 44364.354166666664 | 7.46 |
| 44364.364583333336 | 7.45 |
| 44364.375 | 7.46 |
| 44364.385416666664 | 7.47 |
| 44364.395833333336 | 7.47 |
| 44364.40625 | 7.5 |
| 44364.416666666664 | 7.5 |
| 44364.427083333336 | 7.49 |
| 44364.4375 | 7.5 |
| 44364.447916666664 | 7.5 |
| 44364.458333333336 | 7.51 |
| 44364.46875 | 7.52 |
| 44364.479166666664 | 7.52 |
| 44364.489583333336 | 7.52 |
| 44364.5 | 7.52 |
| 44364.510416666664 | 7.5 |
| 44364.520833333336 | 7.36 |
| 44364.53125 | 7.33 |
| 44364.541666666664 | 7.33 |
| 44364.552083333336 | 7.33 |
| 44364.5625 | 7.33 |
| 44364.572916666664 | 7.35 |
| 44364.583333333336 | 7.36 |
| 44364.59375 | 7.36 |
| 44364.604166666664 | 7.35 |
| 44364.614583333336 | 7.35 |
| 44364.625 | 7.37 |
| 44364.635416666664 | 7.39 |
| 44364.645833333336 | 7.4 |
| 44364.65625 | 7.41 |
| 44364.666666666664 | 7.42 |
| 44364.677083333336 | 7.45 |
| 44364.6875 | 7.46 |
| 44364.697916666664 | 7.45 |
| 44364.708333333336 | 7.47 |
| 44364.71875 | 7.45 |
| 44364.729166666664 | 7.45 |
| 44364.739583333336 | 7.44 |
| 44364.75 | 7.45 |
| 44364.760416666664 | 7.43 |
| 44364.770833333336 | 7.5 |
| 44364.78125 | 7.56 |
| 44364.791666666664 | 7.54 |
| 44364.802083333336 | 7.56 |
| 44364.8125 | 7.58 |
| 44364.822916666664 | 7.59 |
| 44364.833333333336 | 7.63 |
| 44364.84375 | 7.65 |
| 44364.854166666664 | 7.65 |
| 44364.864583333336 | 7.66 |
| 44364.875 | 7.65 |
| 44364.885416666664 | 7.67 |
| 44364.895833333336 | 7.66 |
| 44364.90625 | 7.68 |
| 44364.916666666664 | 7.69 |
| 44364.927083333336 | 7.7 |
| 44364.9375 | 7.7 |
| 44364.947916666664 | 7.74 |
| 44364.958333333336 | 7.76 |
| 44364.96875 | 7.77 |
| 44364.979166666664 | 7.79 |
| 44364.989583333336 | 7.81 |
| 44365.0 | 7.82 |
| 44365.010416666664 | 7.83 |
| 44365.020833333336 | 7.83 |
| 44365.03125 | 7.84 |
| 44365.041666666664 | 7.84 |
| 44365.052083333336 | 7.81 |
| 44365.0625 | 7.79 |
| 44365.072916666664 | 7.78 |
| 44365.083333333336 | 7.78 |
| 44365.09375 | 7.75 |
| 44365.104166666664 | 7.74 |
| 44365.114583333336 | 7.71 |
| 44365.125 | 7.69 |
| 44365.135416666664 | 7.67 |
| 44365.145833333336 | 7.66 |
| 44365.15625 | 7.65 |
| 44365.166666666664 | 7.64 |
| 44365.177083333336 | 7.63 |
| 44365.1875 | 7.62 |
| 44365.197916666664 | 7.61 |
| 44365.208333333336 | 7.61 |
| 44365.21875 | 7.6 |
| 44365.229166666664 | 7.6 |
| 44365.239583333336 | 7.59 |
| 44365.25 | 7.6 |
| 44365.260416666664 | 7.6 |
| 44365.270833333336 | 7.6 |
| 44365.28125 | 7.59 |
| 44365.291666666664 | 7.58 |
| 44365.302083333336 | 7.57 |
| 44365.3125 | 7.58 |
| 44365.322916666664 | 7.57 |
| 44365.333333333336 | 7.55 |
| 44365.34375 | 7.54 |
| 44365.354166666664 | 7.53 |
| 44365.364583333336 | 7.52 |
| 44365.375 | 7.51 |
| 44365.385416666664 | 7.5 |
| 44365.395833333336 | 7.49 |
| 44365.40625 | 7.49 |
| 44365.416666666664 | 7.51 |
| 44365.427083333336 | 7.53 |
| 44365.4375 | 7.53 |
| 44365.447916666664 | 7.54 |
| 44365.458333333336 | 7.55 |
| 44365.46875 | 7.56 |
| 44365.479166666664 | 7.56 |
| 44365.489583333336 | 7.57 |
| 44365.5 | 7.58 |
| 44365.510416666664 | 7.58 |
| 44365.520833333336 | 7.58 |
| 44365.53125 | 7.59 |
| 44365.541666666664 | 7.59 |
| 44365.552083333336 | 7.61 |
| 44365.5625 | 7.61 |
| 44365.572916666664 | 7.59 |
| 44365.583333333336 | 7.58 |
| 44365.59375 | 7.58 |
| 44365.604166666664 | 7.57 |
| 44365.614583333336 | 7.56 |
| 44365.625 | 7.56 |
| 44365.635416666664 | 7.56 |
| 44365.645833333336 | 7.56 |
| 44365.65625 | 7.57 |
| 44365.666666666664 | 7.57 |
| 44365.677083333336 | 7.58 |
| 44365.6875 | 7.58 |
| 44365.697916666664 | 7.59 |
| 44365.708333333336 | 7.6 |
| 44365.71875 | 7.6 |
| 44365.729166666664 | 7.6 |
| 44365.739583333336 | 7.6 |
| 44365.75 | 7.6 |
| 44365.760416666664 | 7.6 |
| 44365.770833333336 | 7.62 |
| 44365.78125 | 7.62 |
| 44365.791666666664 | 7.63 |
| 44365.802083333336 | 7.63 |
| 44365.8125 | 7.63 |
| 44365.822916666664 | 7.63 |
| 44365.833333333336 | 7.63 |
| 44365.84375 | 7.62 |
| 44365.854166666664 | 7.62 |
| 44365.864583333336 | 7.67 |
| 44365.875 | 7.69 |
| 44365.885416666664 | 7.71 |
| 44365.895833333336 | 7.72 |
| 44365.90625 | 7.72 |
| 44365.916666666664 | 7.72 |
| 44365.927083333336 | 7.7 |
| 44365.9375 | 7.7 |
| 44365.947916666664 | 7.71 |
| 44365.958333333336 | 7.72 |
| 44365.96875 | 7.74 |
| 44365.979166666664 | 7.76 |
| 44365.989583333336 | 7.78 |
| 44366.0 | 7.79 |
| 44366.010416666664 | 7.78 |
| 44366.020833333336 | 7.78 |
| 44366.03125 | 7.78 |
| 44366.041666666664 | 7.78 |
| 44366.052083333336 | 7.78 |
| 44366.0625 | 7.78 |
| 44366.072916666664 | 7.78 |
| 44366.083333333336 | 7.77 |
| 44366.09375 | 7.75 |
| 44366.104166666664 | 7.74 |
| 44366.114583333336 | 7.74 |
| 44366.125 | 7.73 |
| 44366.135416666664 | 7.72 |
| 44366.145833333336 | 7.71 |
| 44366.15625 | 7.69 |
| 44366.166666666664 | 7.67 |
| 44366.177083333336 | 7.65 |
| 44366.1875 | 7.65 |
| 44366.197916666664 | 7.64 |
| 44366.208333333336 | 7.63 |
| 44366.21875 | 7.62 |
| 44366.229166666664 | 7.62 |
| 44366.239583333336 | 7.62 |
| 44366.25 | 7.62 |
| 44366.260416666664 | 7.62 |
| 44366.270833333336 | 7.62 |
| 44366.28125 | 7.62 |
| 44366.291666666664 | 7.62 |
| 44366.302083333336 | 7.62 |
| 44366.3125 | 7.61 |
| 44366.322916666664 | 7.61 |
| 44366.333333333336 | 7.6 |
| 44366.34375 | 7.6 |
| 44366.354166666664 | 7.59 |
| 44366.364583333336 | 7.57 |
| 44366.375 | 7.58 |
| 44366.385416666664 | 7.6 |
| 44366.395833333336 | 7.59 |
| 44366.40625 | 7.57 |
| 44366.416666666664 | 7.56 |
| 44366.427083333336 | 7.58 |
| 44366.4375 | 7.57 |
| 44366.447916666664 | 7.56 |
| 44366.458333333336 | 7.58 |
| 44366.46875 | 7.6 |
| 44366.479166666664 | 7.59 |
| 44366.489583333336 | 7.59 |
| 44366.5 | 7.59 |
| 44366.510416666664 | 7.58 |
| 44366.520833333336 | 7.59 |
| 44366.53125 | 7.6 |
| 44366.541666666664 | 7.6 |
| 44366.552083333336 | 7.6 |
| 44366.5625 | 7.61 |
| 44366.572916666664 | 7.61 |
| 44366.583333333336 | 7.62 |
| 44366.59375 | 7.61 |
| 44366.604166666664 | 7.61 |
| 44366.614583333336 | 7.61 |
| 44366.625 | 7.61 |
| 44366.635416666664 | 7.59 |
| 44366.645833333336 | 7.59 |
| 44366.65625 | 7.59 |
| 44366.666666666664 | 7.59 |
| 44366.677083333336 | 7.6 |
| 44366.6875 | 7.61 |
| 44366.697916666664 | 7.6 |
| 44366.708333333336 | 7.62 |
| 44366.71875 | 7.63 |
| 44366.729166666664 | 7.65 |
| 44366.739583333336 | 7.65 |
| 44366.75 | 7.65 |
| 44366.760416666664 | 7.64 |
| 44366.770833333336 | 7.64 |
| 44366.78125 | 7.65 |
| 44366.791666666664 | 7.64 |
| 44366.802083333336 | 7.64 |
| 44366.8125 | 7.64 |
| 44366.822916666664 | 7.64 |
| 44366.833333333336 | 7.64 |
| 44366.84375 | 7.64 |
| 44366.854166666664 | 7.64 |
| 44366.864583333336 | 7.64 |
| 44366.875 | 7.63 |
| 44366.885416666664 | 7.61 |
| 44366.895833333336 | 7.65 |
| 44366.90625 | 7.71 |
| 44366.916666666664 | 7.69 |
| 44366.927083333336 | 7.67 |
| 44366.9375 | 7.71 |
| 44366.947916666664 | 7.69 |
| 44366.958333333336 | 7.68 |
| 44366.96875 | 7.66 |
| 44366.979166666664 | 7.65 |
| 44366.989583333336 | 7.65 |
| 44367.0 | 7.67 |
| 44367.010416666664 | 7.67 |
| 44367.020833333336 | 7.69 |
| 44367.03125 | 7.72 |
| 44367.041666666664 | 7.73 |
| 44367.052083333336 | 7.73 |
| 44367.0625 | 7.73 |
| 44367.072916666664 | 7.72 |
| 44367.083333333336 | 7.74 |
| 44367.09375 | 7.75 |
| 44367.104166666664 | 7.75 |
| 44367.114583333336 | 7.75 |
| 44367.125 | 7.76 |
| 44367.135416666664 | 7.72 |
| 44367.145833333336 | 7.71 |
| 44367.15625 | 7.7 |
| 44367.166666666664 | 7.7 |
| 44367.177083333336 | 7.68 |
| 44367.1875 | 7.68 |
| 44367.197916666664 | 7.66 |
| 44367.208333333336 | 7.65 |
| 44367.21875 | 7.64 |
| 44367.229166666664 | 7.63 |
| 44367.239583333336 | 7.62 |
| 44367.25 | 7.61 |
| 44367.260416666664 | 7.6 |
| 44367.270833333336 | 7.58 |
| 44367.28125 | 7.58 |
| 44367.291666666664 | 7.57 |
| 44367.302083333336 | 7.56 |
| 44367.3125 | 7.57 |
| 44367.322916666664 | 7.57 |
| 44367.333333333336 | 7.58 |
| 44367.34375 | 7.58 |
| 44367.354166666664 | 7.58 |
| 44367.364583333336 | 7.58 |
| 44367.375 | 7.55 |
| 44367.385416666664 | 7.56 |
| 44367.395833333336 | 7.55 |
| 44367.40625 | 7.53 |
| 44367.416666666664 | 7.53 |
| 44367.427083333336 | 7.52 |
| 44367.4375 | 7.49 |
| 44367.447916666664 | 7.49 |
| 44367.458333333336 | 7.46 |
| 44367.46875 | 7.45 |
| 44367.479166666664 | 7.45 |
| 44367.489583333336 | 7.44 |
| 44367.5 | 7.46 |
| 44367.510416666664 | 7.48 |
| 44367.520833333336 | 7.49 |
| 44367.53125 | 7.5 |
| 44367.541666666664 | 7.51 |
| 44367.552083333336 | 7.52 |
| 44367.5625 | 7.52 |
| 44367.572916666664 | 7.55 |
| 44367.583333333336 | 7.56 |
| 44367.59375 | 7.57 |
| 44367.604166666664 | 7.58 |
| 44367.614583333336 | 7.58 |
| 44367.625 | 7.62 |
| 44367.635416666664 | 7.58 |
| 44367.645833333336 | 7.57 |
| 44367.65625 | 7.57 |
| 44367.666666666664 | 7.55 |
| 44367.677083333336 | 7.55 |
| 44367.6875 | 7.55 |
| 44367.697916666664 | 7.55 |
| 44367.708333333336 | 7.57 |
| 44367.71875 | 7.57 |
| 44367.729166666664 | 7.57 |
| 44367.739583333336 | 7.57 |
| 44367.75 | 7.59 |
| 44367.760416666664 | 7.59 |
| 44367.770833333336 | 7.6 |
| 44367.78125 | 7.6 |
| 44367.791666666664 | 7.61 |
| 44367.802083333336 | 7.63 |
| 44367.8125 | 7.63 |
| 44367.822916666664 | 7.63 |
| 44367.833333333336 | 7.63 |
| 44367.84375 | 7.63 |
| 44367.854166666664 | 7.63 |
| 44367.864583333336 | 7.63 |
| 44367.875 | 7.62 |
| 44367.885416666664 | 7.62 |
| 44367.895833333336 | 7.62 |
| 44367.90625 | 7.61 |
| 44367.916666666664 | 7.59 |
| 44367.927083333336 | 7.62 |
| 44367.9375 | 7.61 |
| 44367.947916666664 | 7.62 |
| 44367.958333333336 | 7.66 |
| 44367.96875 | 7.66 |
| 44367.979166666664 | 7.66 |
| 44367.989583333336 | 7.66 |
| 44368.0 | 7.64 |
| 44368.010416666664 | 7.63 |
| 44368.020833333336 | 7.61 |
| 44368.03125 | 7.58 |
| 44368.041666666664 | 7.6 |
| 44368.052083333336 | 7.63 |
| 44368.0625 | 7.65 |
| 44368.072916666664 | 7.65 |
| 44368.083333333336 | 7.64 |
| 44368.09375 | 7.64 |
| 44368.104166666664 | 7.64 |
| 44368.114583333336 | 7.65 |
| 44368.125 | 7.65 |
| 44368.135416666664 | 7.66 |
| 44368.145833333336 | 7.65 |
| 44368.15625 | 7.65 |
| 44368.166666666664 | 7.65 |
| 44368.177083333336 | 7.62 |
| 44368.1875 | 7.62 |
| 44368.197916666664 | 7.62 |
| 44368.208333333336 | 7.61 |
| 44368.21875 | 7.6 |
| 44368.229166666664 | 7.6 |
| 44368.239583333336 | 7.6 |
| 44368.25 | 7.59 |
| 44368.260416666664 | 7.59 |
| 44368.270833333336 | 7.59 |
| 44368.28125 | 7.58 |
| 44368.291666666664 | 7.58 |
| 44368.302083333336 | 7.57 |
| 44368.3125 | 7.57 |
| 44368.322916666664 | 7.57 |
| 44368.333333333336 | 7.57 |
| 44368.34375 | 7.57 |
| 44368.354166666664 | 7.57 |
| 44368.364583333336 | 7.57 |
| 44368.375 | 7.57 |
| 44368.385416666664 | 7.57 |
| 44368.395833333336 | 7.56 |
| 44368.40625 | 7.57 |
| 44368.416666666664 | 7.57 |
| 44368.427083333336 | 7.55 |
| 44368.4375 | 7.54 |
| 44368.447916666664 | 7.54 |
| 44368.458333333336 | 7.53 |
| 44368.46875 | 7.54 |
| 44368.479166666664 | 7.55 |
| 44368.489583333336 | 7.54 |
| 44368.5 | 7.53 |
| 44368.510416666664 | 7.5 |
| 44368.520833333336 | 7.49 |
| 44368.53125 | 7.46 |
| 44368.541666666664 | 7.49 |
| 44368.552083333336 | 7.48 |
| 44368.5625 | 7.49 |
| 44368.572916666664 | 7.51 |
| 44368.583333333336 | 7.51 |
| 44368.59375 | 7.51 |
| 44368.604166666664 | 7.51 |
| 44368.614583333336 | 7.52 |
| 44368.625 | 7.52 |
| 44368.635416666664 | 7.53 |
| 44368.645833333336 | 7.52 |
| 44368.65625 | 7.54 |
| 44368.666666666664 | 7.53 |
| 44368.677083333336 | 7.52 |
| 44368.6875 | 7.51 |
| 44368.697916666664 | 7.51 |
| 44368.708333333336 | 7.52 |
| 44368.71875 | 7.52 |
| 44368.729166666664 | 7.53 |
| 44368.739583333336 | 7.54 |
| 44368.75 | 7.55 |
| 44368.760416666664 | 7.55 |
| 44368.770833333336 | 7.56 |
| 44368.78125 | 7.57 |
| 44368.791666666664 | 7.58 |
| 44368.802083333336 | 7.59 |
| 44368.8125 | 7.59 |
| 44368.822916666664 | 7.6 |
| 44368.833333333336 | 7.6 |
| 44368.84375 | 7.6 |
| 44368.854166666664 | 7.61 |
| 44368.864583333336 | 7.6 |
| 44368.875 | 7.61 |
| 44368.885416666664 | 7.6 |
| 44368.895833333336 | 7.61 |
| 44368.90625 | 7.61 |
| 44368.916666666664 | 7.61 |
| 44368.927083333336 | 7.61 |
| 44368.9375 | 7.6 |
| 44368.947916666664 | 7.59 |
| 44368.958333333336 | 7.59 |
| 44368.96875 | 7.56 |
| 44368.979166666664 | 7.58 |
| 44368.989583333336 | 7.58 |
| 44369.0 | 7.59 |
| 44369.010416666664 | 7.61 |
| 44369.020833333336 | 7.61 |
| 44369.03125 | 7.59 |
| 44369.041666666664 | 7.57 |
| 44369.052083333336 | 7.57 |
| 44369.0625 | 7.55 |
| 44369.072916666664 | 7.52 |
| 44369.083333333336 | 7.48 |
| 44369.09375 | 7.47 |
| 44369.104166666664 | 7.47 |
| 44369.114583333336 | 7.48 |
| 44369.125 | 7.5 |
| 44369.135416666664 | 7.5 |
| 44369.145833333336 | 7.52 |
| 44369.15625 | 7.52 |
| 44369.166666666664 | 7.54 |
| 44369.177083333336 | 7.54 |
| 44369.1875 | 7.53 |
| 44369.197916666664 | 7.55 |
| 44369.208333333336 | 7.54 |
| 44369.21875 | 7.53 |
| 44369.229166666664 | 7.51 |
| 44369.239583333336 | 7.51 |
| 44369.25 | 7.51 |
| 44369.260416666664 | 7.5 |
| 44369.270833333336 | 7.5 |
| 44369.28125 | 7.5 |
| 44369.291666666664 | 7.5 |
| 44369.302083333336 | 7.5 |
| 44369.3125 | 7.5 |
| 44369.322916666664 | 7.5 |
| 44369.333333333336 | 7.5 |
| 44369.34375 | 7.5 |
| 44369.354166666664 | 7.49 |
| 44369.364583333336 | 7.49 |
| 44369.375 | 7.49 |
| 44369.385416666664 | 7.5 |
| 44369.395833333336 | 7.5 |
| 44369.40625 | 7.51 |
| 44369.416666666664 | 7.52 |
| 44369.427083333336 | 7.52 |
| 44369.4375 | 7.52 |
| 44369.447916666664 | 7.52 |
| 44369.458333333336 | 7.51 |
| 44369.46875 | 7.52 |
| 44369.479166666664 | 7.51 |
| 44369.489583333336 | 7.51 |
| 44369.5 | 7.5 |
| 44369.510416666664 | 7.49 |
| 44369.520833333336 | 7.49 |
| 44369.53125 | 7.49 |
| 44369.541666666664 | 7.46 |
| 44369.552083333336 | 7.46 |
| 44369.5625 | 7.47 |
| 44369.572916666664 | 7.47 |
| 44369.583333333336 | 7.46 |
| 44369.59375 | 7.45 |
| 44369.604166666664 | 7.46 |
| 44369.614583333336 | 7.48 |
| 44369.625 | 7.48 |
| 44369.635416666664 | 7.48 |
| 44369.645833333336 | 7.49 |
| 44369.65625 | 7.49 |
| 44369.666666666664 | 7.49 |
| 44369.677083333336 | 7.5 |
| 44369.6875 | 7.52 |
| 44369.697916666664 | 7.53 |
| 44369.708333333336 | 7.55 |
| 44369.71875 | 7.51 |
| 44369.729166666664 | 7.5 |
| 44369.739583333336 | 7.48 |
| 44369.75 | 7.47 |
| 44369.760416666664 | 7.47 |
| 44369.770833333336 | 7.48 |
| 44369.78125 | 7.5 |
| 44369.791666666664 | 7.51 |
| 44369.802083333336 | 7.51 |
| 44369.8125 | 7.52 |
| 44369.822916666664 | 7.53 |
| 44369.833333333336 | 7.54 |
| 44369.84375 | 7.55 |
| 44369.854166666664 | 7.56 |
| 44369.864583333336 | 7.57 |
| 44369.875 | 7.57 |
| 44369.885416666664 | 7.58 |
| 44369.895833333336 | 7.58 |
| 44369.90625 | 7.58 |
| 44369.916666666664 | 7.59 |
| 44369.927083333336 | 7.59 |
| 44369.9375 | 7.58 |
| 44369.947916666664 | 7.58 |
| 44369.958333333336 | 7.58 |
| 44369.96875 | 7.57 |
| 44369.979166666664 | 7.57 |
| 44369.989583333336 | 7.56 |
| 44370.0 | 7.56 |
| 44370.010416666664 | 7.56 |
| 44370.020833333336 | 7.56 |
| 44370.03125 | 7.55 |
| 44370.041666666664 | 7.55 |
| 44370.052083333336 | 7.53 |
| 44370.0625 | 7.53 |
| 44370.072916666664 | 7.51 |
| 44370.083333333336 | 7.51 |
| 44370.09375 | 7.48 |
| 44370.104166666664 | 7.45 |
| 44370.114583333336 | 7.44 |
| 44370.125 | 7.39 |
| 44370.135416666664 | 7.4 |
| 44370.145833333336 | 7.38 |
| 44370.15625 | 7.35 |
| 44370.166666666664 | 7.36 |
| 44370.177083333336 | 7.37 |
| 44370.1875 | 7.37 |
| 44370.197916666664 | 7.36 |
| 44370.208333333336 | 7.36 |
| 44370.21875 | 7.35 |
| 44370.229166666664 | 7.33 |
| 44370.239583333336 | 7.32 |
| 44370.25 | 7.3 |
| 44370.260416666664 | 7.3 |
| 44370.270833333336 | 7.31 |
| 44370.28125 | 7.31 |
| 44370.291666666664 | 7.33 |
| 44370.302083333336 | 7.35 |
| 44370.3125 | 7.37 |
| 44370.322916666664 | 7.38 |
| 44370.333333333336 | 7.4 |
| 44370.34375 | 7.41 |
| 44370.354166666664 | 7.41 |
| 44370.364583333336 | 7.42 |
| 44370.375 | 7.43 |
| 44370.385416666664 | 7.44 |
| 44370.395833333336 | 7.44 |
| 44370.40625 | 7.44 |
| 44370.416666666664 | 7.46 |
| 44370.427083333336 | 7.46 |
| 44370.4375 | 7.48 |
| 44370.447916666664 | 7.49 |
| 44370.458333333336 | 7.49 |
| 44370.46875 | 7.5 |
| 44370.479166666664 | 7.51 |
| 44370.489583333336 | 7.51 |
| 44370.5 | 7.51 |
| 44370.510416666664 | 7.51 |
| 44370.520833333336 | 7.48 |
| 44370.53125 | 7.5 |
| 44370.541666666664 | 7.49 |
| 44370.552083333336 | 7.5 |
| 44370.5625 | 7.49 |
| 44370.572916666664 | 7.48 |
| 44370.583333333336 | 7.47 |
| 44370.59375 | 7.47 |
| 44370.604166666664 | 7.46 |
| 44370.614583333336 | 7.46 |
| 44370.625 | 7.47 |
| 44370.635416666664 | 7.48 |
| 44370.645833333336 | 7.48 |
| 44370.65625 | 7.48 |
| 44370.666666666664 | 7.48 |
| 44370.677083333336 | 7.48 |
| 44370.6875 | 7.48 |
| 44370.697916666664 | 7.48 |
| 44370.708333333336 | 7.47 |
| 44370.71875 | 7.47 |
| 44370.729166666664 | 7.48 |
| 44370.739583333336 | 7.48 |
| 44370.75 | 7.48 |
| 44370.760416666664 | 7.5 |
| 44370.770833333336 | 7.5 |
| 44370.78125 | 7.5 |
| 44370.791666666664 | 7.5 |
| 44370.802083333336 | 7.49 |
| 44370.8125 | 7.5 |
| 44370.822916666664 | 7.51 |
| 44370.833333333336 | 7.53 |
| 44370.84375 | 7.54 |
| 44370.854166666664 | 7.54 |
| 44370.864583333336 | 7.55 |
| 44370.875 | 7.56 |
| 44370.885416666664 | 7.57 |
| 44370.895833333336 | 7.57 |
| 44370.90625 | 7.57 |
| 44370.916666666664 | 7.57 |
| 44370.927083333336 | 7.57 |
| 44370.9375 | 7.58 |
| 44370.947916666664 | 7.58 |
| 44370.958333333336 | 7.58 |
| 44370.96875 | 7.58 |
| 44370.979166666664 | 7.57 |
| 44370.989583333336 | 7.56 |
| 44371.0 | 7.55 |
| 44371.010416666664 | 7.55 |
| 44371.020833333336 | 7.55 |
| 44371.03125 | 7.54 |
| 44371.041666666664 | 7.55 |
| 44371.052083333336 | 7.55 |
| 44371.0625 | 7.54 |
| 44371.072916666664 | 7.53 |
| 44371.083333333336 | 7.54 |
| 44371.09375 | 7.54 |
| 44371.104166666664 | 7.53 |
| 44371.114583333336 | 7.52 |
| 44371.125 | 7.5 |
| 44371.135416666664 | 7.48 |
| 44371.145833333336 | 7.46 |
| 44371.15625 | 7.44 |
| 44371.166666666664 | 7.44 |
| 44371.177083333336 | 7.4 |
| 44371.1875 | 7.4 |
| 44371.197916666664 | 7.43 |
| 44371.208333333336 | 7.43 |
| 44371.21875 | 7.47 |
| 44371.229166666664 | 7.46 |
| 44371.239583333336 | 7.45 |
| 44371.25 | 7.44 |
| 44371.260416666664 | 7.41 |
| 44371.270833333336 | 7.39 |
| 44371.28125 | 7.37 |
| 44371.291666666664 | 7.35 |
| 44371.302083333336 | 7.34 |
| 44371.3125 | 7.35 |
| 44371.322916666664 | 7.35 |
| 44371.333333333336 | 7.35 |
| 44371.34375 | 7.36 |
| 44371.354166666664 | 7.38 |
| 44371.364583333336 | 7.41 |
| 44371.375 | 7.42 |
| 44371.385416666664 | 7.43 |
| 44371.395833333336 | 7.44 |
| 44371.40625 | 7.44 |
| 44371.416666666664 | 7.45 |
| 44371.427083333336 | 7.45 |
| 44371.4375 | 7.46 |
| 44371.447916666664 | 7.46 |
| 44371.458333333336 | 7.47 |
| 44371.46875 | 7.48 |
| 44371.479166666664 | 7.49 |
| 44371.489583333336 | 7.49 |
| 44371.5 | 7.5 |
| 44371.510416666664 | 7.51 |
| 44371.520833333336 | 7.51 |
| 44371.53125 | 7.51 |
| 44371.541666666664 | 7.5 |
| 44371.552083333336 | 7.49 |
| 44371.5625 | 7.51 |
| 44371.572916666664 | 7.53 |
| 44371.583333333336 | 7.53 |
| 44371.59375 | 7.54 |
| 44371.604166666664 | 7.54 |
| 44371.614583333336 | 7.55 |
| 44371.625 | 7.56 |
| 44371.635416666664 | 7.56 |
| 44371.645833333336 | 7.56 |
| 44371.65625 | 7.57 |
| 44371.666666666664 | 7.57 |
| 44371.677083333336 | 7.57 |
| 44371.6875 | 7.58 |
| 44371.697916666664 | 7.59 |
| 44371.708333333336 | 7.59 |
| 44371.71875 | 7.58 |
| 44371.729166666664 | 7.58 |
| 44371.739583333336 | 7.58 |
| 44371.75 | 7.58 |
| 44371.760416666664 | 7.59 |
| 44371.770833333336 | 7.59 |
| 44371.78125 | 7.58 |
| 44371.791666666664 | 7.59 |
| 44371.802083333336 | 7.58 |
| 44371.8125 | 7.6 |
| 44371.822916666664 | 7.6 |
| 44371.833333333336 | 7.61 |
| 44371.84375 | 7.6 |
| 44371.854166666664 | 7.61 |
| 44371.864583333336 | 7.61 |
| 44371.875 | 7.63 |
| 44371.885416666664 | 7.63 |
| 44371.895833333336 | 7.63 |
| 44371.90625 | 7.64 |
| 44371.916666666664 | 7.64 |
| 44371.927083333336 | 7.64 |
| 44371.9375 | 7.64 |
| 44371.947916666664 | 7.64 |
| 44371.958333333336 | 7.64 |
| 44371.96875 | 7.64 |
| 44371.979166666664 | 7.65 |
| 44371.989583333336 | 7.66 |
| 44372.0 | 7.66 |
| 44372.010416666664 | 7.66 |
| 44372.020833333336 | 7.65 |
| 44372.03125 | 7.65 |
| 44372.041666666664 | 7.64 |
| 44372.052083333336 | 7.63 |
| 44372.0625 | 7.63 |
| 44372.072916666664 | 7.61 |
| 44372.083333333336 | 7.62 |
| 44372.09375 | 7.62 |
| 44372.104166666664 | 7.61 |
| 44372.114583333336 | 7.61 |
| 44372.125 | 7.61 |
| 44372.135416666664 | 7.6 |
| 44372.145833333336 | 7.59 |
| 44372.15625 | 7.58 |
| 44372.166666666664 | 7.57 |
| 44372.177083333336 | 7.55 |
| 44372.1875 | 7.53 |
| 44372.197916666664 | 7.52 |
| 44372.208333333336 | 7.5 |
| 44372.21875 | 7.5 |
| 44372.229166666664 | 7.5 |
| 44372.239583333336 | 7.5 |
| 44372.25 | 7.49 |
| 44372.260416666664 | 7.51 |
| 44372.270833333336 | 7.52 |
| 44372.28125 | 7.5 |
| 44372.291666666664 | 7.49 |
| 44372.302083333336 | 7.47 |
| 44372.3125 | 7.44 |
| 44372.322916666664 | 7.42 |
| 44372.333333333336 | 7.4 |
| 44372.34375 | 7.39 |
| 44372.354166666664 | 7.41 |
| 44372.364583333336 | 7.41 |
| 44372.375 | 7.42 |
| 44372.385416666664 | 7.44 |
| 44372.395833333336 | 7.45 |
| 44372.40625 | 7.47 |
| 44372.416666666664 | 7.47 |
| 44372.427083333336 | 7.48 |
| 44372.4375 | 7.49 |
| 44372.447916666664 | 7.49 |
| 44372.458333333336 | 7.5 |
| 44372.46875 | 7.51 |
| 44372.479166666664 | 7.51 |
| 44372.489583333336 | 7.52 |
| 44372.5 | 7.53 |
| 44372.510416666664 | 7.54 |
| 44372.520833333336 | 7.56 |
| 44372.53125 | 7.58 |
| 44372.541666666664 | 7.57 |
| 44372.552083333336 | 7.57 |
| 44372.5625 | 7.57 |
| 44372.572916666664 | 7.56 |
| 44372.583333333336 | 7.55 |
| 44372.59375 | 7.53 |
| 44372.604166666664 | 7.57 |
| 44372.614583333336 | 7.57 |
| 44372.625 | 7.59 |
| 44372.635416666664 | 7.59 |
| 44372.645833333336 | 7.59 |
| 44372.65625 | 7.6 |
| 44372.666666666664 | 7.6 |
| 44372.677083333336 | 7.6 |
| 44372.6875 | 7.6 |
| 44372.697916666664 | 7.6 |
| 44372.708333333336 | 7.6 |
| 44372.71875 | 7.61 |
| 44372.729166666664 | 7.61 |
| 44372.739583333336 | 7.62 |
| 44372.75 | 7.63 |
| 44372.760416666664 | 7.63 |
| 44372.770833333336 | 7.63 |
| 44372.78125 | 7.63 |
| 44372.791666666664 | 7.64 |
| 44372.802083333336 | 7.65 |
| 44372.8125 | 7.67 |
| 44372.822916666664 | 7.65 |
| 44372.833333333336 | 7.66 |
| 44372.84375 | 7.67 |
| 44372.854166666664 | 7.65 |
| 44372.864583333336 | 7.64 |
| 44372.875 | 7.62 |
| 44372.885416666664 | 7.62 |
| 44372.895833333336 | 7.63 |
| 44372.90625 | 7.65 |
| 44372.916666666664 | 7.65 |
| 44372.927083333336 | 7.65 |
| 44372.9375 | 7.65 |
| 44372.947916666664 | 7.65 |
| 44372.958333333336 | 7.66 |
| 44372.96875 | 7.65 |
| 44372.979166666664 | 7.65 |
| 44372.989583333336 | 7.65 |
| 44373.0 | 7.65 |
| 44373.010416666664 | 7.65 |
| 44373.020833333336 | 7.66 |
| 44373.03125 | 7.66 |
| 44373.041666666664 | 7.65 |
| 44373.052083333336 | 7.63 |
| 44373.0625 | 7.62 |
| 44373.072916666664 | 7.61 |
| 44373.083333333336 | 7.6 |
| 44373.09375 | 7.59 |
| 44373.104166666664 | 7.59 |
| 44373.114583333336 | 7.59 |
| 44373.125 | 7.6 |
| 44373.135416666664 | 7.6 |
| 44373.145833333336 | 7.59 |
| 44373.15625 | 7.59 |
| 44373.166666666664 | 7.58 |
| 44373.177083333336 | 7.57 |
| 44373.1875 | 7.56 |
| 44373.197916666664 | 7.53 |
| 44373.208333333336 | 7.51 |
| 44373.21875 | 7.49 |
| 44373.229166666664 | 7.47 |
| 44373.239583333336 | 7.43 |
| 44373.25 | 7.45 |
| 44373.260416666664 | 7.43 |
| 44373.270833333336 | 7.43 |
| 44373.28125 | 7.47 |
| 44373.291666666664 | 7.5 |
| 44373.302083333336 | 7.5 |
| 44373.3125 | 7.5 |
| 44373.322916666664 | 7.48 |
| 44373.333333333336 | 7.47 |
| 44373.34375 | 7.45 |
| 44373.354166666664 | 7.43 |
| 44373.364583333336 | 7.41 |
| 44373.375 | 7.4 |
| 44373.385416666664 | 7.4 |
| 44373.395833333336 | 7.41 |
| 44373.40625 | 7.41 |
| 44373.416666666664 | 7.42 |
| 44373.427083333336 | 7.43 |
| 44373.4375 | 7.45 |
| 44373.447916666664 | 7.45 |
| 44373.458333333336 | 7.47 |
| 44373.46875 | 7.47 |
| 44373.479166666664 | 7.48 |
| 44373.489583333336 | 7.48 |
| 44373.5 | 7.5 |
| 44373.510416666664 | 7.5 |
| 44373.520833333336 | 7.5 |
| 44373.53125 | 7.5 |
| 44373.541666666664 | 7.52 |
| 44373.552083333336 | 7.53 |
| 44373.5625 | 7.54 |
| 44373.572916666664 | 7.55 |
| 44373.583333333336 | 7.56 |
| 44373.59375 | 7.56 |
| 44373.604166666664 | 7.56 |
| 44373.614583333336 | 7.55 |
| 44373.625 | 7.53 |
| 44373.635416666664 | 7.52 |
| 44373.645833333336 | 7.56 |
| 44373.65625 | 7.59 |
| 44373.666666666664 | 7.61 |
| 44373.677083333336 | 7.61 |
| 44373.6875 | 7.61 |
| 44373.697916666664 | 7.62 |
| 44373.708333333336 | 7.63 |
| 44373.71875 | 7.63 |
| 44373.729166666664 | 7.63 |
| 44373.739583333336 | 7.64 |
| 44373.75 | 7.65 |
| 44373.760416666664 | 7.66 |
| 44373.770833333336 | 7.65 |
| 44373.78125 | 7.65 |
| 44373.791666666664 | 7.65 |
| 44373.802083333336 | 7.66 |
| 44373.8125 | 7.67 |
| 44373.822916666664 | 7.67 |
| 44373.833333333336 | 7.68 |
| 44373.84375 | 7.7 |
| 44373.854166666664 | 7.71 |
| 44373.864583333336 | 7.72 |
| 44373.875 | 7.71 |
| 44373.885416666664 | 7.69 |
| 44373.895833333336 | 7.66 |
| 44373.90625 | 7.64 |
| 44373.916666666664 | 7.64 |
| 44373.927083333336 | 7.64 |
| 44373.9375 | 7.64 |
| 44373.947916666664 | 7.64 |
| 44373.958333333336 | 7.64 |
| 44373.96875 | 7.63 |
| 44373.979166666664 | 7.62 |
| 44373.989583333336 | 7.62 |
| 44374.0 | 7.61 |
| 44374.010416666664 | 7.61 |
| 44374.020833333336 | 7.61 |
| 44374.03125 | 7.61 |
| 44374.041666666664 | 7.61 |
| 44374.052083333336 | 7.61 |
| 44374.0625 | 7.6 |
| 44374.072916666664 | 7.6 |
| 44374.083333333336 | 7.59 |
| 44374.09375 | 7.58 |
| 44374.104166666664 | 7.58 |
| 44374.114583333336 | 7.57 |
| 44374.125 | 7.58 |
| 44374.135416666664 | 7.57 |
| 44374.145833333336 | 7.56 |
| 44374.15625 | 7.55 |
| 44374.166666666664 | 7.56 |
| 44374.177083333336 | 7.55 |
| 44374.1875 | 7.56 |
| 44374.197916666664 | 7.56 |
| 44374.208333333336 | 7.57 |
| 44374.21875 | 7.53 |
| 44374.229166666664 | 7.51 |
| 44374.239583333336 | 7.49 |
| 44374.25 | 7.47 |
| 44374.260416666664 | 7.44 |
| 44374.270833333336 | 7.45 |
| 44374.28125 | 7.44 |
| 44374.291666666664 | 7.45 |
| 44374.302083333336 | 7.48 |
| 44374.3125 | 7.48 |
| 44374.322916666664 | 7.48 |
| 44374.333333333336 | 7.49 |
| 44374.34375 | 7.48 |
| 44374.354166666664 | 7.47 |
| 44374.364583333336 | 7.46 |
| 44374.375 | 7.44 |
| 44374.385416666664 | 7.43 |
| 44374.395833333336 | 7.42 |
| 44374.40625 | 7.41 |
| 44374.416666666664 | 7.41 |
| 44374.427083333336 | 7.41 |
| 44374.4375 | 7.41 |
| 44374.447916666664 | 7.41 |
| 44374.458333333336 | 7.42 |
| 44374.46875 | 7.43 |
| 44374.479166666664 | 7.44 |
| 44374.489583333336 | 7.44 |
| 44374.5 | 7.45 |
| 44374.510416666664 | 7.46 |
| 44374.520833333336 | 7.46 |
| 44374.53125 | 7.47 |
| 44374.541666666664 | 7.47 |
| 44374.552083333336 | 7.47 |
| 44374.5625 | 7.47 |
| 44374.572916666664 | 7.48 |
| 44374.583333333336 | 7.49 |
| 44374.59375 | 7.51 |
| 44374.604166666664 | 7.52 |
| 44374.614583333336 | 7.52 |
| 44374.625 | 7.54 |
| 44374.635416666664 | 7.53 |
| 44374.645833333336 | 7.54 |
| 44374.65625 | 7.53 |
| 44374.666666666664 | 7.51 |
| 44374.677083333336 | 7.52 |
| 44374.6875 | 7.58 |
| 44374.697916666664 | 7.59 |
| 44374.708333333336 | 7.6 |
| 44374.71875 | 7.62 |
| 44374.729166666664 | 7.62 |
| 44374.739583333336 | 7.62 |
| 44374.75 | 7.62 |
| 44374.760416666664 | 7.62 |
| 44374.770833333336 | 7.63 |
| 44374.78125 | 7.64 |
| 44374.791666666664 | 7.65 |
| 44374.802083333336 | 7.65 |
| 44374.8125 | 7.66 |
| 44374.822916666664 | 7.68 |
| 44374.833333333336 | 7.69 |
| 44374.84375 | 7.7 |
| 44374.854166666664 | 7.72 |
| 44374.864583333336 | 7.74 |
| 44374.875 | 7.74 |
| 44374.885416666664 | 7.76 |
| 44374.895833333336 | 7.76 |
| 44374.90625 | 7.77 |
| 44374.916666666664 | 7.74 |
| 44374.927083333336 | 7.72 |
| 44374.9375 | 7.7 |
| 44374.947916666664 | 7.67 |
| 44374.958333333336 | 7.66 |
| 44374.96875 | 7.65 |
| 44374.979166666664 | 7.64 |
| 44374.989583333336 | 7.63 |
| 44375.0 | 7.63 |
| 44375.010416666664 | 7.62 |
| 44375.020833333336 | 7.61 |
| 44375.03125 | 7.6 |
| 44375.041666666664 | 7.6 |
| 44375.052083333336 | 7.6 |
| 44375.0625 | 7.6 |
| 44375.072916666664 | 7.6 |
| 44375.083333333336 | 7.6 |
| 44375.09375 | 7.6 |
| 44375.104166666664 | 7.61 |
| 44375.114583333336 | 7.61 |
| 44375.125 | 7.6 |
| 44375.135416666664 | 7.59 |
| 44375.145833333336 | 7.59 |
| 44375.15625 | 7.58 |
| 44375.166666666664 | 7.58 |
| 44375.177083333336 | 7.57 |
| 44375.1875 | 7.55 |
| 44375.197916666664 | 7.55 |
| 44375.208333333336 | 7.56 |
| 44375.21875 | 7.58 |
| 44375.229166666664 | 7.59 |
| 44375.239583333336 | 7.57 |
| 44375.25 | 7.54 |
| 44375.260416666664 | 7.54 |
| 44375.270833333336 | 7.5 |
| 44375.28125 | 7.51 |
| 44375.291666666664 | 7.47 |
| 44375.302083333336 | 7.49 |
| 44375.3125 | 7.51 |
| 44375.322916666664 | 7.51 |
| 44375.333333333336 | 7.5 |
| 44375.34375 | 7.5 |
| 44375.354166666664 | 7.48 |
| 44375.364583333336 | 7.49 |
| 44375.375 | 7.49 |
| 44375.385416666664 | 7.5 |
| 44375.395833333336 | 7.48 |
| 44375.40625 | 7.47 |
| 44375.416666666664 | 7.47 |
| 44375.427083333336 | 7.46 |
| 44375.4375 | 7.4 |
| 44375.447916666664 | 7.45 |
| 44375.458333333336 | 7.44 |
| 44375.46875 | 7.44 |
| 44375.479166666664 | 7.44 |
| 44375.489583333336 | 7.44 |
| 44375.5 | 7.45 |
| 44375.510416666664 | 7.46 |
| 44375.520833333336 | 7.46 |
| 44375.53125 | 7.46 |
| 44375.541666666664 | 7.46 |
| 44375.552083333336 | 7.46 |
| 44375.5625 | 7.47 |
| 44375.572916666664 | 7.47 |
| 44375.583333333336 | 7.47 |
| 44375.59375 | 7.48 |
| 44375.604166666664 | 7.49 |
| 44375.614583333336 | 7.51 |
| 44375.625 | 7.53 |
| 44375.635416666664 | 7.54 |
| 44375.645833333336 | 7.55 |
| 44375.65625 | 7.56 |
| 44375.666666666664 | 7.56 |
| 44375.677083333336 | 7.56 |
| 44375.6875 | 7.56 |
| 44375.697916666664 | 7.54 |
| 44375.708333333336 | 7.56 |
| 44375.71875 | 7.6 |
| 44375.729166666664 | 7.63 |
| 44375.739583333336 | 7.64 |
| 44375.75 | 7.64 |
| 44375.760416666664 | 7.63 |
| 44375.770833333336 | 7.64 |
| 44375.78125 | 7.63 |
| 44375.791666666664 | 7.64 |
| 44375.802083333336 | 7.64 |
| 44375.8125 | 7.66 |
| 44375.822916666664 | 7.69 |
| 44375.833333333336 | 7.69 |
| 44375.84375 | 7.7 |
| 44375.854166666664 | 7.7 |
| 44375.864583333336 | 7.71 |
| 44375.875 | 7.72 |
| 44375.885416666664 | 7.74 |
| 44375.895833333336 | 7.75 |
| 44375.90625 | 7.76 |
| 44375.916666666664 | 7.77 |
| 44375.927083333336 | 7.77 |
| 44375.9375 | 7.76 |
| 44375.947916666664 | 7.76 |
| 44375.958333333336 | 7.72 |
| 44375.96875 | 7.71 |
| 44375.979166666664 | 7.69 |
| 44375.989583333336 | 7.67 |
| 44376.0 | 7.66 |
| 44376.010416666664 | 7.65 |
| 44376.020833333336 | 7.64 |
| 44376.03125 | 7.63 |
| 44376.041666666664 | 7.63 |
| 44376.052083333336 | 7.63 |
| 44376.0625 | 7.62 |
| 44376.072916666664 | 7.61 |
| 44376.083333333336 | 7.62 |
| 44376.09375 | 7.62 |
| 44376.104166666664 | 7.62 |
| 44376.114583333336 | 7.62 |
| 44376.125 | 7.62 |
| 44376.135416666664 | 7.61 |
| 44376.145833333336 | 7.62 |
| 44376.15625 | 7.62 |
| 44376.166666666664 | 7.6 |
| 44376.177083333336 | 7.6 |
| 44376.1875 | 7.6 |
| 44376.197916666664 | 7.6 |
| 44376.208333333336 | 7.6 |
| 44376.21875 | 7.6 |
| 44376.229166666664 | 7.57 |
| 44376.239583333336 | 7.58 |
| 44376.25 | 7.61 |
| 44376.260416666664 | 7.58 |
| 44376.270833333336 | 7.56 |
| 44376.28125 | 7.53 |
| 44376.291666666664 | 7.52 |
| 44376.302083333336 | 7.52 |
| 44376.3125 | 7.48 |
| 44376.322916666664 | 7.51 |
| 44376.333333333336 | 7.54 |
| 44376.34375 | 7.51 |
| 44376.354166666664 | 7.54 |
| 44376.364583333336 | 7.53 |
| 44376.375 | 7.52 |
| 44376.385416666664 | 7.51 |
| 44376.395833333336 | 7.52 |
| 44376.40625 | 7.51 |
| 44376.416666666664 | 7.49 |
| 44376.427083333336 | 7.5 |
| 44376.4375 | 7.48 |
| 44376.447916666664 | 7.48 |
| 44376.458333333336 | 7.47 |
| 44376.46875 | 7.43 |
| 44376.479166666664 | 7.45 |
| 44376.489583333336 | 7.46 |
| 44376.5 | 7.46 |
| 44376.510416666664 | 7.46 |
| 44376.520833333336 | 7.46 |
| 44376.53125 | 7.45 |
| 44376.541666666664 | 7.46 |
| 44376.552083333336 | 7.47 |
| 44376.5625 | 7.47 |
| 44376.572916666664 | 7.47 |
| 44376.583333333336 | 7.47 |
| 44376.59375 | 7.48 |
| 44376.604166666664 | 7.48 |
| 44376.614583333336 | 7.49 |
| 44376.625 | 7.5 |
| 44376.635416666664 | 7.52 |
| 44376.645833333336 | 7.53 |
| 44376.65625 | 7.54 |
| 44376.666666666664 | 7.57 |
| 44376.677083333336 | 7.56 |
| 44376.6875 | 7.57 |
| 44376.697916666664 | 7.59 |
| 44376.708333333336 | 7.58 |
| 44376.71875 | 7.59 |
| 44376.729166666664 | 7.6 |
| 44376.739583333336 | 7.61 |
| 44376.75 | 7.61 |
| 44376.760416666664 | 7.68 |
| 44376.770833333336 | 7.67 |
| 44376.78125 | 7.69 |
| 44376.791666666664 | 7.69 |
| 44376.802083333336 | 7.7 |
| 44376.8125 | 7.7 |
| 44376.822916666664 | 7.69 |
| 44376.833333333336 | 7.69 |
| 44376.84375 | 7.71 |
| 44376.854166666664 | 7.74 |
| 44376.864583333336 | 7.76 |
| 44376.875 | 7.77 |
| 44376.885416666664 | 7.78 |
| 44376.895833333336 | 7.78 |
| 44376.90625 | 7.78 |
| 44376.916666666664 | 7.78 |
| 44376.927083333336 | 7.79 |
| 44376.9375 | 7.79 |
| 44376.947916666664 | 7.79 |
| 44376.958333333336 | 7.8 |
| 44376.96875 | 7.79 |
| 44376.979166666664 | 7.79 |
| 44376.989583333336 | 7.76 |
| 44377.0 | 7.73 |
| 44377.010416666664 | 7.71 |
| 44377.020833333336 | 7.7 |
| 44377.03125 | 7.69 |
| 44377.041666666664 | 7.69 |
| 44377.052083333336 | 7.68 |
| 44377.0625 | 7.67 |
| 44377.072916666664 | 7.67 |
| 44377.083333333336 | 7.67 |
| 44377.09375 | 7.67 |
| 44377.104166666664 | 7.66 |
| 44377.114583333336 | 7.66 |
| 44377.125 | 7.66 |
| 44377.135416666664 | 7.68 |
| 44377.145833333336 | 7.68 |
| 44377.15625 | 7.68 |
| 44377.166666666664 | 7.67 |
| 44377.177083333336 | 7.66 |
| 44377.1875 | 7.65 |
| 44377.197916666664 | 7.63 |
| 44377.208333333336 | 7.63 |
| 44377.21875 | 7.59 |
| 44377.229166666664 | 7.56 |
| 44377.239583333336 | 7.54 |
| 44377.25 | 7.58 |
| 44377.260416666664 | 7.59 |
| 44377.270833333336 | 7.62 |
| 44377.28125 | 7.65 |
| 44377.291666666664 | 7.66 |
| 44377.302083333336 | 7.61 |
| 44377.3125 | 7.62 |
| 44377.322916666664 | 7.57 |
| 44377.333333333336 | 7.55 |
| 44377.34375 | 7.56 |
| 44377.354166666664 | 7.55 |
| 44377.364583333336 | 7.58 |
| 44377.375 | 7.58 |
| 44377.385416666664 | 7.57 |
| 44377.395833333336 | 7.56 |
| 44377.40625 | 7.55 |
| 44377.416666666664 | 7.54 |
| 44377.427083333336 | 7.54 |
| 44377.4375 | 7.54 |
| 44377.447916666664 | 7.54 |
| 44377.458333333336 | 7.53 |
| 44377.46875 | 7.53 |
| 44377.479166666664 | 7.51 |
| 44377.489583333336 | 7.47 |
| 44377.5 | 7.45 |
| 44377.510416666664 | 7.46 |
| 44377.520833333336 | 7.47 |
| 44377.53125 | 7.48 |
| 44377.541666666664 | 7.48 |
| 44377.552083333336 | 7.47 |
| 44377.5625 | 7.49 |
| 44377.572916666664 | 7.51 |
| 44377.583333333336 | 7.54 |
| 44377.59375 | 7.51 |
| 44377.604166666664 | 7.54 |
| 44377.614583333336 | 7.55 |
| 44377.625 | 7.53 |
| 44377.635416666664 | 7.56 |
| 44377.645833333336 | 7.59 |
| 44377.65625 | 7.6 |
| 44377.666666666664 | 7.62 |
| 44377.677083333336 | 7.61 |
| 44377.6875 | 7.62 |
| 44377.697916666664 | 7.64 |
| 44377.708333333336 | 7.63 |
| 44377.71875 | 7.62 |
| 44377.729166666664 | 7.62 |
| 44377.739583333336 | 7.64 |
| 44377.75 | 7.63 |
| 44377.760416666664 | 7.61 |
| 44377.770833333336 | 7.53 |
| 44377.78125 | 7.61 |
| 44377.791666666664 | 7.72 |
| 44377.802083333336 | 7.74 |
| 44377.8125 | 7.71 |
| 44377.822916666664 | 7.74 |
| 44377.833333333336 | 7.8 |
| 44377.84375 | 7.85 |
| 44377.854166666664 | 7.83 |
| 44377.864583333336 | 7.83 |
| 44377.875 | 7.82 |
| 44377.885416666664 | 7.8 |
| 44377.895833333336 | 7.82 |
| 44377.90625 | 7.84 |
| 44377.916666666664 | 7.86 |
| 44377.927083333336 | 7.87 |
| 44377.9375 | 7.88 |
| 44377.947916666664 | 7.88 |
| 44377.958333333336 | 7.89 |
| 44377.96875 | 7.89 |
| 44377.979166666664 | 7.88 |
| 44377.989583333336 | 7.88 |
| 44378.0 | 7.87 |
| 44378.010416666664 | 7.86 |
| 44378.020833333336 | 7.85 |
| 44378.03125 | 7.81 |
| 44378.041666666664 | 7.8 |
| 44378.052083333336 | 7.79 |
| 44378.0625 | 7.77 |
| 44378.072916666664 | 7.74 |
| 44378.083333333336 | 7.74 |
| 44378.09375 | 7.75 |
| 44378.104166666664 | 7.72 |
| 44378.114583333336 | 7.71 |
| 44378.125 | 7.69 |
| 44378.135416666664 | 7.68 |
| 44378.145833333336 | 7.68 |
| 44378.15625 | 7.68 |